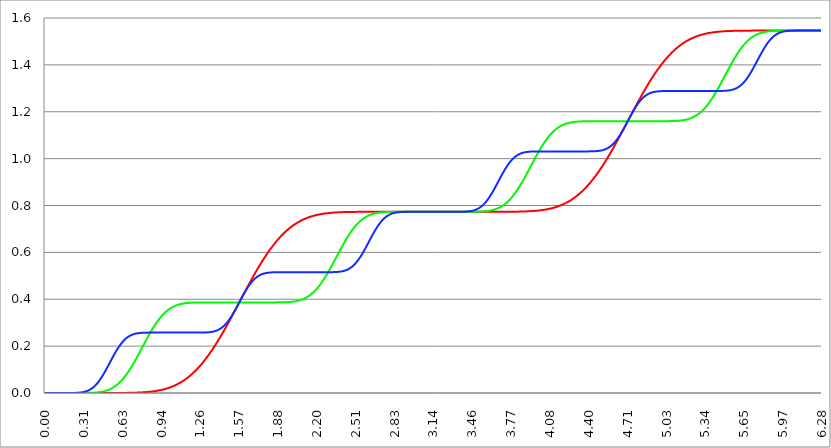
| Category | Series 1 | Series 0 | Series 2 |
|---|---|---|---|
| 0.0 | 0 | 0 | 0 |
| 0.00314159265358979 | 0 | 0 | 0 |
| 0.00628318530717958 | 0 | 0 | 0 |
| 0.00942477796076938 | 0 | 0 | 0 |
| 0.0125663706143592 | 0 | 0 | 0 |
| 0.015707963267949 | 0 | 0 | 0 |
| 0.0188495559215388 | 0 | 0 | 0 |
| 0.0219911485751285 | 0 | 0 | 0 |
| 0.0251327412287183 | 0 | 0 | 0 |
| 0.0282743338823081 | 0 | 0 | 0 |
| 0.0314159265358979 | 0 | 0 | 0 |
| 0.0345575191894877 | 0 | 0 | 0 |
| 0.0376991118430775 | 0 | 0 | 0 |
| 0.0408407044966673 | 0 | 0 | 0 |
| 0.0439822971502571 | 0 | 0 | 0 |
| 0.0471238898038469 | 0 | 0 | 0 |
| 0.0502654824574367 | 0 | 0 | 0 |
| 0.0534070751110265 | 0 | 0 | 0 |
| 0.0565486677646163 | 0 | 0 | 0 |
| 0.059690260418206 | 0 | 0 | 0 |
| 0.0628318530717958 | 0 | 0 | 0 |
| 0.0659734457253856 | 0 | 0 | 0 |
| 0.0691150383789754 | 0 | 0 | 0 |
| 0.0722566310325652 | 0 | 0 | 0 |
| 0.075398223686155 | 0 | 0 | 0 |
| 0.0785398163397448 | 0 | 0 | 0 |
| 0.0816814089933346 | 0 | 0 | 0 |
| 0.0848230016469244 | 0 | 0 | 0 |
| 0.0879645943005142 | 0 | 0 | 0 |
| 0.091106186954104 | 0 | 0 | 0 |
| 0.0942477796076937 | 0 | 0 | 0 |
| 0.0973893722612835 | 0 | 0 | 0 |
| 0.100530964914873 | 0 | 0 | 0 |
| 0.103672557568463 | 0 | 0 | 0 |
| 0.106814150222053 | 0 | 0 | 0 |
| 0.109955742875643 | 0 | 0 | 0 |
| 0.113097335529233 | 0 | 0 | 0 |
| 0.116238928182822 | 0 | 0 | 0 |
| 0.119380520836412 | 0 | 0 | 0 |
| 0.122522113490002 | 0 | 0 | 0 |
| 0.125663706143592 | 0 | 0 | 0 |
| 0.128805298797181 | 0 | 0 | 0 |
| 0.131946891450771 | 0 | 0 | 0 |
| 0.135088484104361 | 0 | 0 | 0 |
| 0.138230076757951 | 0 | 0 | 0 |
| 0.141371669411541 | 0 | 0 | 0 |
| 0.14451326206513 | 0 | 0 | 0 |
| 0.14765485471872 | 0 | 0 | 0 |
| 0.15079644737231 | 0 | 0 | 0 |
| 0.1539380400259 | 0 | 0 | 0 |
| 0.15707963267949 | 0 | 0 | 0 |
| 0.160221225333079 | 0 | 0 | 0 |
| 0.163362817986669 | 0 | 0 | 0 |
| 0.166504410640259 | 0 | 0 | 0 |
| 0.169646003293849 | 0 | 0 | 0 |
| 0.172787595947439 | 0 | 0 | 0 |
| 0.175929188601028 | 0 | 0 | 0 |
| 0.179070781254618 | 0 | 0 | 0 |
| 0.182212373908208 | 0 | 0 | 0 |
| 0.185353966561798 | 0 | 0 | 0 |
| 0.188495559215388 | 0 | 0 | 0 |
| 0.191637151868977 | 0 | 0 | 0 |
| 0.194778744522567 | 0 | 0 | 0 |
| 0.197920337176157 | 0 | 0 | 0 |
| 0.201061929829747 | 0 | 0 | 0 |
| 0.204203522483336 | 0 | 0 | 0 |
| 0.207345115136926 | 0 | 0 | 0 |
| 0.210486707790516 | 0 | 0 | 0 |
| 0.213628300444106 | 0 | 0 | 0 |
| 0.216769893097696 | 0 | 0 | 0 |
| 0.219911485751285 | 0 | 0 | 0 |
| 0.223053078404875 | 0 | 0 | 0 |
| 0.226194671058465 | 0 | 0 | 0 |
| 0.229336263712055 | 0 | 0 | 0 |
| 0.232477856365645 | 0 | 0 | 0 |
| 0.235619449019234 | 0 | 0 | 0 |
| 0.238761041672824 | 0 | 0 | 0 |
| 0.241902634326414 | 0 | 0 | 0 |
| 0.245044226980004 | 0 | 0 | 0 |
| 0.248185819633594 | 0 | 0 | 0.001 |
| 0.251327412287183 | 0 | 0 | 0.001 |
| 0.254469004940773 | 0 | 0 | 0.001 |
| 0.257610597594363 | 0 | 0 | 0.001 |
| 0.260752190247953 | 0 | 0 | 0.001 |
| 0.263893782901543 | 0 | 0 | 0.001 |
| 0.267035375555132 | 0 | 0 | 0.001 |
| 0.270176968208722 | 0 | 0 | 0.001 |
| 0.273318560862312 | 0 | 0 | 0.001 |
| 0.276460153515902 | 0 | 0 | 0.001 |
| 0.279601746169492 | 0 | 0 | 0.002 |
| 0.282743338823082 | 0 | 0 | 0.002 |
| 0.285884931476671 | 0 | 0 | 0.002 |
| 0.289026524130261 | 0 | 0 | 0.002 |
| 0.292168116783851 | 0 | 0 | 0.002 |
| 0.295309709437441 | 0 | 0 | 0.003 |
| 0.298451302091031 | 0 | 0 | 0.003 |
| 0.30159289474462 | 0 | 0 | 0.003 |
| 0.30473448739821 | 0 | 0 | 0.003 |
| 0.3078760800518 | 0 | 0 | 0.004 |
| 0.31101767270539 | 0 | 0 | 0.004 |
| 0.31415926535898 | 0 | 0 | 0.004 |
| 0.31730085801257 | 0 | 0 | 0.005 |
| 0.320442450666159 | 0 | 0 | 0.005 |
| 0.323584043319749 | 0 | 0 | 0.006 |
| 0.326725635973339 | 0 | 0 | 0.006 |
| 0.329867228626929 | 0 | 0 | 0.007 |
| 0.333008821280519 | 0 | 0 | 0.007 |
| 0.336150413934108 | 0 | 0 | 0.008 |
| 0.339292006587698 | 0 | 0 | 0.008 |
| 0.342433599241288 | 0 | 0 | 0.009 |
| 0.345575191894878 | 0 | 0 | 0.01 |
| 0.348716784548468 | 0 | 0 | 0.01 |
| 0.351858377202058 | 0 | 0 | 0.011 |
| 0.354999969855647 | 0 | 0.001 | 0.012 |
| 0.358141562509237 | 0 | 0.001 | 0.013 |
| 0.361283155162827 | 0 | 0.001 | 0.014 |
| 0.364424747816417 | 0 | 0.001 | 0.015 |
| 0.367566340470007 | 0 | 0.001 | 0.016 |
| 0.370707933123597 | 0 | 0.001 | 0.017 |
| 0.373849525777186 | 0 | 0.001 | 0.018 |
| 0.376991118430776 | 0 | 0.001 | 0.019 |
| 0.380132711084366 | 0 | 0.001 | 0.02 |
| 0.383274303737956 | 0 | 0.001 | 0.021 |
| 0.386415896391546 | 0 | 0.001 | 0.023 |
| 0.389557489045135 | 0 | 0.001 | 0.024 |
| 0.392699081698725 | 0 | 0.001 | 0.025 |
| 0.395840674352315 | 0 | 0.001 | 0.027 |
| 0.398982267005905 | 0 | 0.002 | 0.028 |
| 0.402123859659495 | 0 | 0.002 | 0.03 |
| 0.405265452313085 | 0 | 0.002 | 0.032 |
| 0.408407044966674 | 0 | 0.002 | 0.033 |
| 0.411548637620264 | 0 | 0.002 | 0.035 |
| 0.414690230273854 | 0 | 0.002 | 0.037 |
| 0.417831822927444 | 0 | 0.002 | 0.039 |
| 0.420973415581034 | 0 | 0.003 | 0.04 |
| 0.424115008234623 | 0 | 0.003 | 0.042 |
| 0.427256600888213 | 0 | 0.003 | 0.044 |
| 0.430398193541803 | 0 | 0.003 | 0.047 |
| 0.433539786195393 | 0 | 0.003 | 0.049 |
| 0.436681378848983 | 0 | 0.003 | 0.051 |
| 0.439822971502573 | 0 | 0.004 | 0.053 |
| 0.442964564156162 | 0 | 0.004 | 0.055 |
| 0.446106156809752 | 0 | 0.004 | 0.058 |
| 0.449247749463342 | 0 | 0.004 | 0.06 |
| 0.452389342116932 | 0 | 0.005 | 0.063 |
| 0.455530934770522 | 0 | 0.005 | 0.065 |
| 0.458672527424111 | 0 | 0.005 | 0.068 |
| 0.461814120077701 | 0 | 0.006 | 0.07 |
| 0.464955712731291 | 0 | 0.006 | 0.073 |
| 0.468097305384881 | 0 | 0.006 | 0.076 |
| 0.471238898038471 | 0 | 0.007 | 0.079 |
| 0.474380490692061 | 0 | 0.007 | 0.081 |
| 0.47752208334565 | 0 | 0.007 | 0.084 |
| 0.48066367599924 | 0 | 0.008 | 0.087 |
| 0.48380526865283 | 0 | 0.008 | 0.09 |
| 0.48694686130642 | 0 | 0.009 | 0.093 |
| 0.49008845396001 | 0 | 0.009 | 0.096 |
| 0.493230046613599 | 0 | 0.01 | 0.099 |
| 0.496371639267189 | 0 | 0.01 | 0.102 |
| 0.499513231920779 | 0 | 0.011 | 0.105 |
| 0.502654824574369 | 0 | 0.011 | 0.108 |
| 0.505796417227959 | 0 | 0.012 | 0.111 |
| 0.508938009881549 | 0 | 0.013 | 0.114 |
| 0.512079602535138 | 0 | 0.013 | 0.117 |
| 0.515221195188728 | 0 | 0.014 | 0.12 |
| 0.518362787842318 | 0 | 0.015 | 0.124 |
| 0.521504380495908 | 0 | 0.015 | 0.127 |
| 0.524645973149498 | 0 | 0.016 | 0.13 |
| 0.527787565803087 | 0 | 0.017 | 0.133 |
| 0.530929158456677 | 0 | 0.018 | 0.136 |
| 0.534070751110267 | 0 | 0.018 | 0.139 |
| 0.537212343763857 | 0 | 0.019 | 0.142 |
| 0.540353936417447 | 0 | 0.02 | 0.146 |
| 0.543495529071037 | 0 | 0.021 | 0.149 |
| 0.546637121724626 | 0 | 0.022 | 0.152 |
| 0.549778714378216 | 0 | 0.023 | 0.155 |
| 0.552920307031806 | 0 | 0.024 | 0.158 |
| 0.556061899685396 | 0 | 0.025 | 0.161 |
| 0.559203492338986 | 0 | 0.026 | 0.164 |
| 0.562345084992576 | 0 | 0.027 | 0.167 |
| 0.565486677646165 | 0 | 0.028 | 0.17 |
| 0.568628270299755 | 0 | 0.03 | 0.173 |
| 0.571769862953345 | 0 | 0.031 | 0.175 |
| 0.574911455606935 | 0 | 0.032 | 0.178 |
| 0.578053048260525 | 0 | 0.033 | 0.181 |
| 0.581194640914114 | 0 | 0.035 | 0.184 |
| 0.584336233567704 | 0 | 0.036 | 0.186 |
| 0.587477826221294 | 0 | 0.037 | 0.189 |
| 0.590619418874884 | 0 | 0.039 | 0.192 |
| 0.593761011528474 | 0 | 0.04 | 0.194 |
| 0.596902604182064 | 0 | 0.042 | 0.197 |
| 0.600044196835653 | 0 | 0.043 | 0.199 |
| 0.603185789489243 | 0 | 0.045 | 0.201 |
| 0.606327382142833 | 0 | 0.046 | 0.204 |
| 0.609468974796423 | 0 | 0.048 | 0.206 |
| 0.612610567450013 | 0 | 0.05 | 0.208 |
| 0.615752160103602 | 0 | 0.052 | 0.21 |
| 0.618893752757192 | 0 | 0.053 | 0.213 |
| 0.622035345410782 | 0 | 0.055 | 0.215 |
| 0.625176938064372 | 0 | 0.057 | 0.217 |
| 0.628318530717962 | 0 | 0.059 | 0.219 |
| 0.631460123371551 | 0 | 0.061 | 0.22 |
| 0.634601716025141 | 0 | 0.063 | 0.222 |
| 0.637743308678731 | 0 | 0.065 | 0.224 |
| 0.640884901332321 | 0 | 0.067 | 0.226 |
| 0.644026493985911 | 0 | 0.069 | 0.227 |
| 0.647168086639501 | 0 | 0.071 | 0.229 |
| 0.65030967929309 | 0 | 0.073 | 0.23 |
| 0.65345127194668 | 0 | 0.075 | 0.232 |
| 0.65659286460027 | 0 | 0.077 | 0.233 |
| 0.65973445725386 | 0.001 | 0.08 | 0.235 |
| 0.66287604990745 | 0.001 | 0.082 | 0.236 |
| 0.666017642561039 | 0.001 | 0.084 | 0.237 |
| 0.669159235214629 | 0.001 | 0.087 | 0.238 |
| 0.672300827868219 | 0.001 | 0.089 | 0.24 |
| 0.675442420521809 | 0.001 | 0.092 | 0.241 |
| 0.678584013175399 | 0.001 | 0.094 | 0.242 |
| 0.681725605828989 | 0.001 | 0.097 | 0.243 |
| 0.684867198482578 | 0.001 | 0.099 | 0.244 |
| 0.688008791136168 | 0.001 | 0.102 | 0.245 |
| 0.691150383789758 | 0.001 | 0.104 | 0.245 |
| 0.694291976443348 | 0.001 | 0.107 | 0.246 |
| 0.697433569096938 | 0.001 | 0.11 | 0.247 |
| 0.700575161750528 | 0.001 | 0.112 | 0.248 |
| 0.703716754404117 | 0.001 | 0.115 | 0.248 |
| 0.706858347057707 | 0.001 | 0.118 | 0.249 |
| 0.709999939711297 | 0.001 | 0.121 | 0.25 |
| 0.713141532364887 | 0.001 | 0.123 | 0.25 |
| 0.716283125018477 | 0.001 | 0.126 | 0.251 |
| 0.719424717672066 | 0.001 | 0.129 | 0.251 |
| 0.722566310325656 | 0.001 | 0.132 | 0.252 |
| 0.725707902979246 | 0.001 | 0.135 | 0.252 |
| 0.728849495632836 | 0.001 | 0.138 | 0.253 |
| 0.731991088286426 | 0.001 | 0.141 | 0.253 |
| 0.735132680940016 | 0.001 | 0.144 | 0.253 |
| 0.738274273593605 | 0.001 | 0.147 | 0.254 |
| 0.741415866247195 | 0.002 | 0.15 | 0.254 |
| 0.744557458900785 | 0.002 | 0.153 | 0.254 |
| 0.747699051554375 | 0.002 | 0.156 | 0.255 |
| 0.750840644207965 | 0.002 | 0.159 | 0.255 |
| 0.753982236861554 | 0.002 | 0.162 | 0.255 |
| 0.757123829515144 | 0.002 | 0.165 | 0.255 |
| 0.760265422168734 | 0.002 | 0.168 | 0.256 |
| 0.763407014822324 | 0.002 | 0.171 | 0.256 |
| 0.766548607475914 | 0.002 | 0.174 | 0.256 |
| 0.769690200129504 | 0.002 | 0.178 | 0.256 |
| 0.772831792783093 | 0.002 | 0.181 | 0.256 |
| 0.775973385436683 | 0.002 | 0.184 | 0.256 |
| 0.779114978090273 | 0.002 | 0.187 | 0.257 |
| 0.782256570743863 | 0.003 | 0.19 | 0.257 |
| 0.785398163397453 | 0.003 | 0.193 | 0.257 |
| 0.788539756051042 | 0.003 | 0.196 | 0.257 |
| 0.791681348704632 | 0.003 | 0.2 | 0.257 |
| 0.794822941358222 | 0.003 | 0.203 | 0.257 |
| 0.797964534011812 | 0.003 | 0.206 | 0.257 |
| 0.801106126665402 | 0.003 | 0.209 | 0.257 |
| 0.804247719318992 | 0.003 | 0.212 | 0.257 |
| 0.807389311972581 | 0.003 | 0.215 | 0.257 |
| 0.810530904626171 | 0.004 | 0.218 | 0.257 |
| 0.813672497279761 | 0.004 | 0.221 | 0.257 |
| 0.816814089933351 | 0.004 | 0.224 | 0.257 |
| 0.819955682586941 | 0.004 | 0.228 | 0.257 |
| 0.823097275240531 | 0.004 | 0.231 | 0.258 |
| 0.82623886789412 | 0.004 | 0.234 | 0.258 |
| 0.82938046054771 | 0.004 | 0.237 | 0.258 |
| 0.8325220532013 | 0.005 | 0.24 | 0.258 |
| 0.83566364585489 | 0.005 | 0.243 | 0.258 |
| 0.83880523850848 | 0.005 | 0.246 | 0.258 |
| 0.841946831162069 | 0.005 | 0.249 | 0.258 |
| 0.845088423815659 | 0.005 | 0.252 | 0.258 |
| 0.848230016469249 | 0.005 | 0.254 | 0.258 |
| 0.851371609122839 | 0.006 | 0.257 | 0.258 |
| 0.854513201776429 | 0.006 | 0.26 | 0.258 |
| 0.857654794430019 | 0.006 | 0.263 | 0.258 |
| 0.860796387083608 | 0.006 | 0.266 | 0.258 |
| 0.863937979737198 | 0.006 | 0.269 | 0.258 |
| 0.867079572390788 | 0.007 | 0.271 | 0.258 |
| 0.870221165044378 | 0.007 | 0.274 | 0.258 |
| 0.873362757697968 | 0.007 | 0.277 | 0.258 |
| 0.876504350351557 | 0.007 | 0.28 | 0.258 |
| 0.879645943005147 | 0.007 | 0.282 | 0.258 |
| 0.882787535658737 | 0.008 | 0.285 | 0.258 |
| 0.885929128312327 | 0.008 | 0.287 | 0.258 |
| 0.889070720965917 | 0.008 | 0.29 | 0.258 |
| 0.892212313619507 | 0.008 | 0.292 | 0.258 |
| 0.895353906273096 | 0.009 | 0.295 | 0.258 |
| 0.898495498926686 | 0.009 | 0.297 | 0.258 |
| 0.901637091580276 | 0.009 | 0.3 | 0.258 |
| 0.904778684233866 | 0.009 | 0.302 | 0.258 |
| 0.907920276887456 | 0.01 | 0.305 | 0.258 |
| 0.911061869541045 | 0.01 | 0.307 | 0.258 |
| 0.914203462194635 | 0.01 | 0.309 | 0.258 |
| 0.917345054848225 | 0.011 | 0.311 | 0.258 |
| 0.920486647501815 | 0.011 | 0.313 | 0.258 |
| 0.923628240155405 | 0.011 | 0.316 | 0.258 |
| 0.926769832808995 | 0.012 | 0.318 | 0.258 |
| 0.929911425462584 | 0.012 | 0.32 | 0.258 |
| 0.933053018116174 | 0.012 | 0.322 | 0.258 |
| 0.936194610769764 | 0.013 | 0.324 | 0.258 |
| 0.939336203423354 | 0.013 | 0.326 | 0.258 |
| 0.942477796076944 | 0.013 | 0.328 | 0.258 |
| 0.945619388730533 | 0.014 | 0.33 | 0.258 |
| 0.948760981384123 | 0.014 | 0.331 | 0.258 |
| 0.951902574037713 | 0.015 | 0.333 | 0.258 |
| 0.955044166691303 | 0.015 | 0.335 | 0.258 |
| 0.958185759344893 | 0.015 | 0.337 | 0.258 |
| 0.961327351998483 | 0.016 | 0.338 | 0.258 |
| 0.964468944652072 | 0.016 | 0.34 | 0.258 |
| 0.967610537305662 | 0.017 | 0.342 | 0.258 |
| 0.970752129959252 | 0.017 | 0.343 | 0.258 |
| 0.973893722612842 | 0.018 | 0.345 | 0.258 |
| 0.977035315266432 | 0.018 | 0.346 | 0.258 |
| 0.980176907920022 | 0.019 | 0.348 | 0.258 |
| 0.983318500573611 | 0.019 | 0.349 | 0.258 |
| 0.986460093227201 | 0.02 | 0.351 | 0.258 |
| 0.989601685880791 | 0.02 | 0.352 | 0.258 |
| 0.992743278534381 | 0.021 | 0.353 | 0.258 |
| 0.995884871187971 | 0.021 | 0.355 | 0.258 |
| 0.99902646384156 | 0.022 | 0.356 | 0.258 |
| 1.00216805649515 | 0.022 | 0.357 | 0.258 |
| 1.00530964914874 | 0.023 | 0.358 | 0.258 |
| 1.00845124180233 | 0.023 | 0.359 | 0.258 |
| 1.01159283445592 | 0.024 | 0.36 | 0.258 |
| 1.01473442710951 | 0.025 | 0.361 | 0.258 |
| 1.017876019763099 | 0.025 | 0.363 | 0.258 |
| 1.021017612416689 | 0.026 | 0.364 | 0.258 |
| 1.02415920507028 | 0.027 | 0.365 | 0.258 |
| 1.027300797723869 | 0.027 | 0.365 | 0.258 |
| 1.030442390377459 | 0.028 | 0.366 | 0.258 |
| 1.033583983031048 | 0.029 | 0.367 | 0.258 |
| 1.036725575684638 | 0.029 | 0.368 | 0.258 |
| 1.039867168338228 | 0.03 | 0.369 | 0.258 |
| 1.043008760991818 | 0.031 | 0.37 | 0.258 |
| 1.046150353645408 | 0.031 | 0.37 | 0.258 |
| 1.049291946298998 | 0.032 | 0.371 | 0.258 |
| 1.052433538952587 | 0.033 | 0.372 | 0.258 |
| 1.055575131606177 | 0.034 | 0.373 | 0.258 |
| 1.058716724259767 | 0.034 | 0.373 | 0.258 |
| 1.061858316913357 | 0.035 | 0.374 | 0.258 |
| 1.064999909566947 | 0.036 | 0.375 | 0.258 |
| 1.068141502220536 | 0.037 | 0.375 | 0.258 |
| 1.071283094874126 | 0.038 | 0.376 | 0.258 |
| 1.074424687527716 | 0.039 | 0.376 | 0.258 |
| 1.077566280181306 | 0.04 | 0.377 | 0.258 |
| 1.080707872834896 | 0.04 | 0.377 | 0.258 |
| 1.083849465488486 | 0.041 | 0.378 | 0.258 |
| 1.086991058142075 | 0.042 | 0.378 | 0.258 |
| 1.090132650795665 | 0.043 | 0.379 | 0.258 |
| 1.093274243449255 | 0.044 | 0.379 | 0.258 |
| 1.096415836102845 | 0.045 | 0.379 | 0.258 |
| 1.099557428756435 | 0.046 | 0.38 | 0.258 |
| 1.102699021410025 | 0.047 | 0.38 | 0.258 |
| 1.105840614063614 | 0.048 | 0.381 | 0.258 |
| 1.108982206717204 | 0.049 | 0.381 | 0.258 |
| 1.112123799370794 | 0.05 | 0.381 | 0.258 |
| 1.115265392024384 | 0.051 | 0.382 | 0.258 |
| 1.118406984677974 | 0.052 | 0.382 | 0.258 |
| 1.121548577331563 | 0.053 | 0.382 | 0.258 |
| 1.124690169985153 | 0.055 | 0.382 | 0.258 |
| 1.127831762638743 | 0.056 | 0.383 | 0.258 |
| 1.130973355292333 | 0.057 | 0.383 | 0.258 |
| 1.134114947945923 | 0.058 | 0.383 | 0.258 |
| 1.137256540599513 | 0.059 | 0.383 | 0.258 |
| 1.140398133253102 | 0.06 | 0.384 | 0.258 |
| 1.143539725906692 | 0.062 | 0.384 | 0.258 |
| 1.146681318560282 | 0.063 | 0.384 | 0.258 |
| 1.149822911213872 | 0.064 | 0.384 | 0.258 |
| 1.152964503867462 | 0.065 | 0.384 | 0.258 |
| 1.156106096521051 | 0.067 | 0.384 | 0.258 |
| 1.159247689174641 | 0.068 | 0.385 | 0.258 |
| 1.162389281828231 | 0.069 | 0.385 | 0.258 |
| 1.165530874481821 | 0.071 | 0.385 | 0.258 |
| 1.168672467135411 | 0.072 | 0.385 | 0.258 |
| 1.171814059789001 | 0.073 | 0.385 | 0.258 |
| 1.17495565244259 | 0.075 | 0.385 | 0.258 |
| 1.17809724509618 | 0.076 | 0.385 | 0.258 |
| 1.18123883774977 | 0.078 | 0.385 | 0.258 |
| 1.18438043040336 | 0.079 | 0.385 | 0.258 |
| 1.18752202305695 | 0.08 | 0.386 | 0.258 |
| 1.190663615710539 | 0.082 | 0.386 | 0.258 |
| 1.193805208364129 | 0.083 | 0.386 | 0.258 |
| 1.19694680101772 | 0.085 | 0.386 | 0.258 |
| 1.200088393671309 | 0.087 | 0.386 | 0.258 |
| 1.203229986324899 | 0.088 | 0.386 | 0.258 |
| 1.206371578978489 | 0.09 | 0.386 | 0.258 |
| 1.209513171632078 | 0.091 | 0.386 | 0.258 |
| 1.212654764285668 | 0.093 | 0.386 | 0.258 |
| 1.215796356939258 | 0.095 | 0.386 | 0.258 |
| 1.218937949592848 | 0.096 | 0.386 | 0.258 |
| 1.222079542246438 | 0.098 | 0.386 | 0.258 |
| 1.225221134900027 | 0.1 | 0.386 | 0.258 |
| 1.228362727553617 | 0.101 | 0.386 | 0.258 |
| 1.231504320207207 | 0.103 | 0.386 | 0.258 |
| 1.234645912860797 | 0.105 | 0.386 | 0.258 |
| 1.237787505514387 | 0.107 | 0.386 | 0.258 |
| 1.240929098167977 | 0.108 | 0.386 | 0.258 |
| 1.244070690821566 | 0.11 | 0.386 | 0.258 |
| 1.247212283475156 | 0.112 | 0.386 | 0.258 |
| 1.250353876128746 | 0.114 | 0.386 | 0.258 |
| 1.253495468782336 | 0.116 | 0.386 | 0.258 |
| 1.256637061435926 | 0.118 | 0.386 | 0.258 |
| 1.259778654089515 | 0.12 | 0.386 | 0.258 |
| 1.262920246743105 | 0.121 | 0.386 | 0.258 |
| 1.266061839396695 | 0.123 | 0.386 | 0.258 |
| 1.269203432050285 | 0.125 | 0.386 | 0.258 |
| 1.272345024703875 | 0.127 | 0.386 | 0.258 |
| 1.275486617357465 | 0.129 | 0.386 | 0.258 |
| 1.278628210011054 | 0.131 | 0.386 | 0.258 |
| 1.281769802664644 | 0.133 | 0.386 | 0.258 |
| 1.284911395318234 | 0.136 | 0.387 | 0.258 |
| 1.288052987971824 | 0.138 | 0.387 | 0.258 |
| 1.291194580625414 | 0.14 | 0.387 | 0.258 |
| 1.294336173279003 | 0.142 | 0.387 | 0.258 |
| 1.297477765932593 | 0.144 | 0.387 | 0.258 |
| 1.300619358586183 | 0.146 | 0.387 | 0.258 |
| 1.303760951239773 | 0.148 | 0.387 | 0.258 |
| 1.306902543893363 | 0.151 | 0.387 | 0.259 |
| 1.310044136546953 | 0.153 | 0.387 | 0.259 |
| 1.313185729200542 | 0.155 | 0.387 | 0.259 |
| 1.316327321854132 | 0.157 | 0.387 | 0.259 |
| 1.319468914507722 | 0.16 | 0.387 | 0.259 |
| 1.322610507161312 | 0.162 | 0.387 | 0.259 |
| 1.325752099814902 | 0.164 | 0.387 | 0.259 |
| 1.328893692468491 | 0.166 | 0.387 | 0.259 |
| 1.332035285122081 | 0.169 | 0.387 | 0.26 |
| 1.335176877775671 | 0.171 | 0.387 | 0.26 |
| 1.338318470429261 | 0.174 | 0.387 | 0.26 |
| 1.341460063082851 | 0.176 | 0.387 | 0.26 |
| 1.344601655736441 | 0.178 | 0.387 | 0.26 |
| 1.34774324839003 | 0.181 | 0.387 | 0.261 |
| 1.35088484104362 | 0.183 | 0.387 | 0.261 |
| 1.35402643369721 | 0.186 | 0.387 | 0.261 |
| 1.3571680263508 | 0.188 | 0.387 | 0.262 |
| 1.36030961900439 | 0.191 | 0.387 | 0.262 |
| 1.363451211657979 | 0.193 | 0.387 | 0.262 |
| 1.36659280431157 | 0.196 | 0.387 | 0.263 |
| 1.369734396965159 | 0.198 | 0.387 | 0.263 |
| 1.372875989618749 | 0.201 | 0.387 | 0.264 |
| 1.376017582272339 | 0.203 | 0.387 | 0.264 |
| 1.379159174925929 | 0.206 | 0.387 | 0.265 |
| 1.382300767579518 | 0.209 | 0.387 | 0.265 |
| 1.385442360233108 | 0.211 | 0.387 | 0.266 |
| 1.388583952886698 | 0.214 | 0.387 | 0.267 |
| 1.391725545540288 | 0.217 | 0.387 | 0.267 |
| 1.394867138193878 | 0.219 | 0.387 | 0.268 |
| 1.398008730847468 | 0.222 | 0.387 | 0.269 |
| 1.401150323501057 | 0.225 | 0.387 | 0.269 |
| 1.404291916154647 | 0.227 | 0.387 | 0.27 |
| 1.407433508808237 | 0.23 | 0.387 | 0.271 |
| 1.410575101461827 | 0.233 | 0.387 | 0.272 |
| 1.413716694115417 | 0.236 | 0.387 | 0.273 |
| 1.416858286769006 | 0.239 | 0.387 | 0.274 |
| 1.419999879422596 | 0.241 | 0.387 | 0.275 |
| 1.423141472076186 | 0.244 | 0.387 | 0.276 |
| 1.426283064729776 | 0.247 | 0.387 | 0.277 |
| 1.429424657383366 | 0.25 | 0.387 | 0.279 |
| 1.432566250036956 | 0.253 | 0.387 | 0.28 |
| 1.435707842690545 | 0.255 | 0.387 | 0.281 |
| 1.438849435344135 | 0.258 | 0.387 | 0.283 |
| 1.441991027997725 | 0.261 | 0.387 | 0.284 |
| 1.445132620651315 | 0.264 | 0.387 | 0.286 |
| 1.448274213304905 | 0.267 | 0.387 | 0.287 |
| 1.451415805958494 | 0.27 | 0.387 | 0.289 |
| 1.454557398612084 | 0.273 | 0.387 | 0.29 |
| 1.457698991265674 | 0.276 | 0.387 | 0.292 |
| 1.460840583919264 | 0.279 | 0.387 | 0.294 |
| 1.463982176572854 | 0.282 | 0.387 | 0.296 |
| 1.467123769226444 | 0.285 | 0.387 | 0.298 |
| 1.470265361880033 | 0.288 | 0.387 | 0.3 |
| 1.473406954533623 | 0.291 | 0.387 | 0.302 |
| 1.476548547187213 | 0.294 | 0.387 | 0.304 |
| 1.479690139840803 | 0.297 | 0.387 | 0.306 |
| 1.482831732494393 | 0.3 | 0.387 | 0.308 |
| 1.485973325147982 | 0.303 | 0.387 | 0.31 |
| 1.489114917801572 | 0.306 | 0.387 | 0.312 |
| 1.492256510455162 | 0.309 | 0.387 | 0.315 |
| 1.495398103108752 | 0.312 | 0.387 | 0.317 |
| 1.498539695762342 | 0.315 | 0.387 | 0.32 |
| 1.501681288415932 | 0.318 | 0.387 | 0.322 |
| 1.504822881069521 | 0.321 | 0.387 | 0.325 |
| 1.507964473723111 | 0.324 | 0.387 | 0.327 |
| 1.511106066376701 | 0.327 | 0.387 | 0.33 |
| 1.514247659030291 | 0.33 | 0.387 | 0.333 |
| 1.517389251683881 | 0.333 | 0.387 | 0.335 |
| 1.520530844337471 | 0.337 | 0.387 | 0.338 |
| 1.52367243699106 | 0.34 | 0.387 | 0.341 |
| 1.52681402964465 | 0.343 | 0.387 | 0.344 |
| 1.52995562229824 | 0.346 | 0.387 | 0.347 |
| 1.53309721495183 | 0.349 | 0.387 | 0.35 |
| 1.53623880760542 | 0.352 | 0.387 | 0.353 |
| 1.539380400259009 | 0.355 | 0.387 | 0.356 |
| 1.542521992912599 | 0.358 | 0.387 | 0.359 |
| 1.545663585566189 | 0.361 | 0.387 | 0.362 |
| 1.548805178219779 | 0.365 | 0.387 | 0.365 |
| 1.551946770873369 | 0.368 | 0.387 | 0.368 |
| 1.555088363526959 | 0.371 | 0.387 | 0.371 |
| 1.558229956180548 | 0.374 | 0.387 | 0.374 |
| 1.561371548834138 | 0.377 | 0.387 | 0.377 |
| 1.564513141487728 | 0.38 | 0.387 | 0.38 |
| 1.567654734141318 | 0.383 | 0.387 | 0.383 |
| 1.570796326794908 | 0.387 | 0.387 | 0.387 |
| 1.573937919448497 | 0.39 | 0.387 | 0.39 |
| 1.577079512102087 | 0.393 | 0.387 | 0.393 |
| 1.580221104755677 | 0.396 | 0.387 | 0.396 |
| 1.583362697409267 | 0.399 | 0.387 | 0.399 |
| 1.586504290062857 | 0.402 | 0.387 | 0.402 |
| 1.589645882716447 | 0.405 | 0.387 | 0.405 |
| 1.592787475370036 | 0.409 | 0.387 | 0.408 |
| 1.595929068023626 | 0.412 | 0.387 | 0.411 |
| 1.599070660677216 | 0.415 | 0.387 | 0.415 |
| 1.602212253330806 | 0.418 | 0.387 | 0.418 |
| 1.605353845984396 | 0.421 | 0.387 | 0.421 |
| 1.608495438637985 | 0.424 | 0.387 | 0.423 |
| 1.611637031291575 | 0.427 | 0.387 | 0.426 |
| 1.614778623945165 | 0.43 | 0.387 | 0.429 |
| 1.617920216598755 | 0.434 | 0.387 | 0.432 |
| 1.621061809252345 | 0.437 | 0.387 | 0.435 |
| 1.624203401905935 | 0.44 | 0.387 | 0.438 |
| 1.627344994559524 | 0.443 | 0.387 | 0.441 |
| 1.630486587213114 | 0.446 | 0.387 | 0.443 |
| 1.633628179866704 | 0.449 | 0.387 | 0.446 |
| 1.636769772520294 | 0.452 | 0.387 | 0.448 |
| 1.639911365173884 | 0.455 | 0.387 | 0.451 |
| 1.643052957827473 | 0.458 | 0.387 | 0.454 |
| 1.646194550481063 | 0.461 | 0.387 | 0.456 |
| 1.649336143134653 | 0.464 | 0.387 | 0.458 |
| 1.652477735788243 | 0.467 | 0.387 | 0.461 |
| 1.655619328441833 | 0.47 | 0.387 | 0.463 |
| 1.658760921095423 | 0.473 | 0.387 | 0.465 |
| 1.661902513749012 | 0.476 | 0.387 | 0.467 |
| 1.665044106402602 | 0.479 | 0.387 | 0.47 |
| 1.668185699056192 | 0.482 | 0.387 | 0.472 |
| 1.671327291709782 | 0.485 | 0.387 | 0.474 |
| 1.674468884363372 | 0.488 | 0.387 | 0.476 |
| 1.677610477016961 | 0.491 | 0.387 | 0.477 |
| 1.680752069670551 | 0.494 | 0.387 | 0.479 |
| 1.683893662324141 | 0.497 | 0.387 | 0.481 |
| 1.687035254977731 | 0.5 | 0.387 | 0.483 |
| 1.690176847631321 | 0.503 | 0.387 | 0.484 |
| 1.693318440284911 | 0.506 | 0.387 | 0.486 |
| 1.6964600329385 | 0.509 | 0.387 | 0.488 |
| 1.69960162559209 | 0.512 | 0.387 | 0.489 |
| 1.70274321824568 | 0.515 | 0.387 | 0.491 |
| 1.70588481089927 | 0.518 | 0.387 | 0.492 |
| 1.70902640355286 | 0.521 | 0.387 | 0.493 |
| 1.712167996206449 | 0.523 | 0.387 | 0.494 |
| 1.715309588860039 | 0.526 | 0.387 | 0.496 |
| 1.71845118151363 | 0.529 | 0.387 | 0.497 |
| 1.721592774167219 | 0.532 | 0.387 | 0.498 |
| 1.724734366820809 | 0.535 | 0.387 | 0.499 |
| 1.727875959474399 | 0.537 | 0.387 | 0.5 |
| 1.731017552127988 | 0.54 | 0.387 | 0.501 |
| 1.734159144781578 | 0.543 | 0.387 | 0.502 |
| 1.737300737435168 | 0.546 | 0.387 | 0.503 |
| 1.740442330088758 | 0.548 | 0.387 | 0.504 |
| 1.743583922742348 | 0.551 | 0.387 | 0.504 |
| 1.746725515395937 | 0.554 | 0.387 | 0.505 |
| 1.749867108049527 | 0.556 | 0.387 | 0.506 |
| 1.753008700703117 | 0.559 | 0.387 | 0.507 |
| 1.756150293356707 | 0.562 | 0.387 | 0.507 |
| 1.759291886010297 | 0.564 | 0.387 | 0.508 |
| 1.762433478663887 | 0.567 | 0.387 | 0.508 |
| 1.765575071317476 | 0.57 | 0.387 | 0.509 |
| 1.768716663971066 | 0.572 | 0.387 | 0.509 |
| 1.771858256624656 | 0.575 | 0.387 | 0.51 |
| 1.774999849278246 | 0.577 | 0.387 | 0.51 |
| 1.778141441931836 | 0.58 | 0.387 | 0.511 |
| 1.781283034585426 | 0.582 | 0.387 | 0.511 |
| 1.784424627239015 | 0.585 | 0.387 | 0.511 |
| 1.787566219892605 | 0.587 | 0.387 | 0.512 |
| 1.790707812546195 | 0.59 | 0.387 | 0.512 |
| 1.793849405199785 | 0.592 | 0.387 | 0.512 |
| 1.796990997853375 | 0.595 | 0.387 | 0.513 |
| 1.800132590506964 | 0.597 | 0.387 | 0.513 |
| 1.803274183160554 | 0.6 | 0.387 | 0.513 |
| 1.806415775814144 | 0.602 | 0.387 | 0.513 |
| 1.809557368467734 | 0.604 | 0.387 | 0.514 |
| 1.812698961121324 | 0.607 | 0.387 | 0.514 |
| 1.815840553774914 | 0.609 | 0.387 | 0.514 |
| 1.818982146428503 | 0.611 | 0.387 | 0.514 |
| 1.822123739082093 | 0.614 | 0.387 | 0.514 |
| 1.825265331735683 | 0.616 | 0.387 | 0.514 |
| 1.828406924389273 | 0.618 | 0.387 | 0.514 |
| 1.831548517042863 | 0.62 | 0.387 | 0.514 |
| 1.834690109696452 | 0.623 | 0.387 | 0.515 |
| 1.837831702350042 | 0.625 | 0.387 | 0.515 |
| 1.840973295003632 | 0.627 | 0.387 | 0.515 |
| 1.844114887657222 | 0.629 | 0.387 | 0.515 |
| 1.847256480310812 | 0.631 | 0.387 | 0.515 |
| 1.850398072964402 | 0.633 | 0.387 | 0.515 |
| 1.853539665617991 | 0.636 | 0.387 | 0.515 |
| 1.856681258271581 | 0.638 | 0.387 | 0.515 |
| 1.859822850925171 | 0.64 | 0.387 | 0.515 |
| 1.862964443578761 | 0.642 | 0.387 | 0.515 |
| 1.866106036232351 | 0.644 | 0.387 | 0.515 |
| 1.86924762888594 | 0.646 | 0.387 | 0.515 |
| 1.87238922153953 | 0.648 | 0.387 | 0.515 |
| 1.87553081419312 | 0.65 | 0.387 | 0.515 |
| 1.87867240684671 | 0.652 | 0.387 | 0.515 |
| 1.8818139995003 | 0.654 | 0.387 | 0.515 |
| 1.88495559215389 | 0.656 | 0.387 | 0.515 |
| 1.888097184807479 | 0.657 | 0.387 | 0.515 |
| 1.891238777461069 | 0.659 | 0.387 | 0.515 |
| 1.89438037011466 | 0.661 | 0.387 | 0.515 |
| 1.897521962768249 | 0.663 | 0.387 | 0.515 |
| 1.900663555421839 | 0.665 | 0.387 | 0.515 |
| 1.903805148075429 | 0.667 | 0.387 | 0.515 |
| 1.906946740729018 | 0.668 | 0.387 | 0.515 |
| 1.910088333382608 | 0.67 | 0.387 | 0.515 |
| 1.913229926036198 | 0.672 | 0.387 | 0.515 |
| 1.916371518689788 | 0.674 | 0.387 | 0.515 |
| 1.919513111343378 | 0.675 | 0.387 | 0.515 |
| 1.922654703996967 | 0.677 | 0.387 | 0.515 |
| 1.925796296650557 | 0.679 | 0.387 | 0.515 |
| 1.928937889304147 | 0.68 | 0.387 | 0.515 |
| 1.932079481957737 | 0.682 | 0.387 | 0.515 |
| 1.935221074611327 | 0.683 | 0.387 | 0.515 |
| 1.938362667264917 | 0.685 | 0.387 | 0.515 |
| 1.941504259918506 | 0.687 | 0.387 | 0.515 |
| 1.944645852572096 | 0.688 | 0.387 | 0.515 |
| 1.947787445225686 | 0.69 | 0.387 | 0.515 |
| 1.950929037879276 | 0.691 | 0.388 | 0.515 |
| 1.954070630532866 | 0.693 | 0.388 | 0.515 |
| 1.957212223186455 | 0.694 | 0.388 | 0.515 |
| 1.960353815840045 | 0.696 | 0.388 | 0.515 |
| 1.963495408493635 | 0.697 | 0.388 | 0.515 |
| 1.966637001147225 | 0.698 | 0.388 | 0.515 |
| 1.969778593800815 | 0.7 | 0.388 | 0.515 |
| 1.972920186454405 | 0.701 | 0.388 | 0.515 |
| 1.976061779107994 | 0.703 | 0.388 | 0.515 |
| 1.979203371761584 | 0.704 | 0.388 | 0.515 |
| 1.982344964415174 | 0.705 | 0.389 | 0.515 |
| 1.985486557068764 | 0.707 | 0.389 | 0.515 |
| 1.988628149722354 | 0.708 | 0.389 | 0.515 |
| 1.991769742375943 | 0.709 | 0.389 | 0.515 |
| 1.994911335029533 | 0.71 | 0.389 | 0.515 |
| 1.998052927683123 | 0.712 | 0.389 | 0.515 |
| 2.001194520336712 | 0.713 | 0.39 | 0.515 |
| 2.004336112990302 | 0.714 | 0.39 | 0.515 |
| 2.007477705643892 | 0.715 | 0.39 | 0.515 |
| 2.010619298297482 | 0.716 | 0.39 | 0.515 |
| 2.013760890951071 | 0.717 | 0.39 | 0.515 |
| 2.016902483604661 | 0.719 | 0.391 | 0.515 |
| 2.02004407625825 | 0.72 | 0.391 | 0.515 |
| 2.02318566891184 | 0.721 | 0.391 | 0.515 |
| 2.02632726156543 | 0.722 | 0.392 | 0.515 |
| 2.029468854219019 | 0.723 | 0.392 | 0.515 |
| 2.032610446872609 | 0.724 | 0.392 | 0.515 |
| 2.035752039526198 | 0.725 | 0.393 | 0.515 |
| 2.038893632179788 | 0.726 | 0.393 | 0.515 |
| 2.042035224833378 | 0.727 | 0.393 | 0.515 |
| 2.045176817486967 | 0.728 | 0.394 | 0.515 |
| 2.048318410140557 | 0.729 | 0.394 | 0.515 |
| 2.051460002794146 | 0.73 | 0.394 | 0.515 |
| 2.054601595447736 | 0.731 | 0.395 | 0.515 |
| 2.057743188101325 | 0.732 | 0.395 | 0.515 |
| 2.060884780754915 | 0.733 | 0.396 | 0.515 |
| 2.064026373408505 | 0.734 | 0.396 | 0.515 |
| 2.067167966062094 | 0.734 | 0.397 | 0.515 |
| 2.070309558715684 | 0.735 | 0.397 | 0.515 |
| 2.073451151369273 | 0.736 | 0.398 | 0.515 |
| 2.076592744022863 | 0.737 | 0.399 | 0.515 |
| 2.079734336676452 | 0.738 | 0.399 | 0.515 |
| 2.082875929330042 | 0.739 | 0.4 | 0.515 |
| 2.086017521983632 | 0.739 | 0.4 | 0.515 |
| 2.089159114637221 | 0.74 | 0.401 | 0.515 |
| 2.092300707290811 | 0.741 | 0.402 | 0.515 |
| 2.095442299944401 | 0.742 | 0.403 | 0.515 |
| 2.09858389259799 | 0.742 | 0.403 | 0.515 |
| 2.10172548525158 | 0.743 | 0.404 | 0.515 |
| 2.104867077905169 | 0.744 | 0.405 | 0.515 |
| 2.108008670558759 | 0.745 | 0.406 | 0.515 |
| 2.111150263212349 | 0.745 | 0.407 | 0.515 |
| 2.114291855865938 | 0.746 | 0.408 | 0.515 |
| 2.117433448519528 | 0.747 | 0.409 | 0.515 |
| 2.120575041173117 | 0.747 | 0.41 | 0.515 |
| 2.123716633826707 | 0.748 | 0.411 | 0.515 |
| 2.126858226480297 | 0.748 | 0.412 | 0.515 |
| 2.129999819133886 | 0.749 | 0.413 | 0.515 |
| 2.133141411787476 | 0.75 | 0.414 | 0.515 |
| 2.136283004441065 | 0.75 | 0.415 | 0.515 |
| 2.139424597094655 | 0.751 | 0.416 | 0.515 |
| 2.142566189748245 | 0.751 | 0.417 | 0.515 |
| 2.145707782401834 | 0.752 | 0.419 | 0.515 |
| 2.148849375055424 | 0.753 | 0.42 | 0.515 |
| 2.151990967709013 | 0.753 | 0.421 | 0.515 |
| 2.155132560362603 | 0.754 | 0.423 | 0.515 |
| 2.158274153016193 | 0.754 | 0.424 | 0.515 |
| 2.161415745669782 | 0.755 | 0.425 | 0.515 |
| 2.164557338323372 | 0.755 | 0.427 | 0.515 |
| 2.167698930976961 | 0.756 | 0.428 | 0.515 |
| 2.170840523630551 | 0.756 | 0.43 | 0.515 |
| 2.173982116284141 | 0.756 | 0.431 | 0.515 |
| 2.17712370893773 | 0.757 | 0.433 | 0.515 |
| 2.18026530159132 | 0.757 | 0.435 | 0.515 |
| 2.183406894244909 | 0.758 | 0.436 | 0.515 |
| 2.186548486898499 | 0.758 | 0.438 | 0.515 |
| 2.189690079552089 | 0.759 | 0.44 | 0.515 |
| 2.192831672205678 | 0.759 | 0.442 | 0.515 |
| 2.195973264859268 | 0.759 | 0.443 | 0.515 |
| 2.199114857512857 | 0.76 | 0.445 | 0.515 |
| 2.202256450166447 | 0.76 | 0.447 | 0.515 |
| 2.205398042820036 | 0.76 | 0.449 | 0.515 |
| 2.208539635473626 | 0.761 | 0.451 | 0.515 |
| 2.211681228127216 | 0.761 | 0.453 | 0.515 |
| 2.214822820780805 | 0.762 | 0.455 | 0.515 |
| 2.217964413434395 | 0.762 | 0.457 | 0.515 |
| 2.221106006087984 | 0.762 | 0.46 | 0.515 |
| 2.224247598741574 | 0.762 | 0.462 | 0.515 |
| 2.227389191395164 | 0.763 | 0.464 | 0.515 |
| 2.230530784048753 | 0.763 | 0.466 | 0.515 |
| 2.233672376702343 | 0.763 | 0.469 | 0.515 |
| 2.236813969355933 | 0.764 | 0.471 | 0.515 |
| 2.239955562009522 | 0.764 | 0.473 | 0.515 |
| 2.243097154663112 | 0.764 | 0.476 | 0.515 |
| 2.246238747316701 | 0.765 | 0.478 | 0.515 |
| 2.249380339970291 | 0.765 | 0.481 | 0.515 |
| 2.252521932623881 | 0.765 | 0.483 | 0.515 |
| 2.25566352527747 | 0.765 | 0.486 | 0.515 |
| 2.25880511793106 | 0.766 | 0.488 | 0.515 |
| 2.261946710584649 | 0.766 | 0.491 | 0.515 |
| 2.265088303238239 | 0.766 | 0.494 | 0.515 |
| 2.268229895891829 | 0.766 | 0.496 | 0.515 |
| 2.271371488545418 | 0.766 | 0.499 | 0.515 |
| 2.274513081199008 | 0.767 | 0.502 | 0.515 |
| 2.277654673852597 | 0.767 | 0.504 | 0.515 |
| 2.280796266506186 | 0.767 | 0.507 | 0.515 |
| 2.283937859159776 | 0.767 | 0.51 | 0.515 |
| 2.287079451813366 | 0.767 | 0.513 | 0.515 |
| 2.290221044466955 | 0.768 | 0.516 | 0.515 |
| 2.293362637120545 | 0.768 | 0.519 | 0.515 |
| 2.296504229774135 | 0.768 | 0.522 | 0.515 |
| 2.299645822427724 | 0.768 | 0.524 | 0.516 |
| 2.302787415081314 | 0.768 | 0.527 | 0.516 |
| 2.305929007734904 | 0.768 | 0.53 | 0.516 |
| 2.309070600388493 | 0.769 | 0.533 | 0.516 |
| 2.312212193042083 | 0.769 | 0.536 | 0.516 |
| 2.315353785695672 | 0.769 | 0.539 | 0.516 |
| 2.318495378349262 | 0.769 | 0.542 | 0.516 |
| 2.321636971002852 | 0.769 | 0.546 | 0.516 |
| 2.324778563656441 | 0.769 | 0.549 | 0.516 |
| 2.327920156310031 | 0.769 | 0.552 | 0.516 |
| 2.33106174896362 | 0.77 | 0.555 | 0.516 |
| 2.33420334161721 | 0.77 | 0.558 | 0.516 |
| 2.3373449342708 | 0.77 | 0.561 | 0.516 |
| 2.340486526924389 | 0.77 | 0.564 | 0.516 |
| 2.343628119577979 | 0.77 | 0.567 | 0.516 |
| 2.346769712231568 | 0.77 | 0.57 | 0.516 |
| 2.349911304885158 | 0.77 | 0.574 | 0.516 |
| 2.353052897538748 | 0.77 | 0.577 | 0.516 |
| 2.356194490192337 | 0.77 | 0.58 | 0.516 |
| 2.359336082845927 | 0.771 | 0.583 | 0.516 |
| 2.362477675499516 | 0.771 | 0.586 | 0.517 |
| 2.365619268153106 | 0.771 | 0.589 | 0.517 |
| 2.368760860806696 | 0.771 | 0.592 | 0.517 |
| 2.371902453460285 | 0.771 | 0.596 | 0.517 |
| 2.375044046113875 | 0.771 | 0.599 | 0.517 |
| 2.378185638767464 | 0.771 | 0.602 | 0.517 |
| 2.381327231421054 | 0.771 | 0.605 | 0.517 |
| 2.384468824074644 | 0.771 | 0.608 | 0.518 |
| 2.387610416728233 | 0.771 | 0.611 | 0.518 |
| 2.390752009381823 | 0.771 | 0.614 | 0.518 |
| 2.393893602035412 | 0.771 | 0.617 | 0.518 |
| 2.397035194689002 | 0.772 | 0.62 | 0.519 |
| 2.400176787342591 | 0.772 | 0.623 | 0.519 |
| 2.403318379996181 | 0.772 | 0.626 | 0.519 |
| 2.406459972649771 | 0.772 | 0.629 | 0.52 |
| 2.40960156530336 | 0.772 | 0.632 | 0.52 |
| 2.41274315795695 | 0.772 | 0.635 | 0.52 |
| 2.41588475061054 | 0.772 | 0.638 | 0.521 |
| 2.419026343264129 | 0.772 | 0.641 | 0.521 |
| 2.422167935917719 | 0.772 | 0.644 | 0.522 |
| 2.425309528571308 | 0.772 | 0.647 | 0.522 |
| 2.428451121224898 | 0.772 | 0.65 | 0.523 |
| 2.431592713878488 | 0.772 | 0.652 | 0.523 |
| 2.434734306532077 | 0.772 | 0.655 | 0.524 |
| 2.437875899185667 | 0.772 | 0.658 | 0.525 |
| 2.441017491839256 | 0.772 | 0.661 | 0.525 |
| 2.444159084492846 | 0.772 | 0.663 | 0.526 |
| 2.447300677146435 | 0.772 | 0.666 | 0.527 |
| 2.450442269800025 | 0.772 | 0.669 | 0.528 |
| 2.453583862453615 | 0.772 | 0.671 | 0.529 |
| 2.456725455107204 | 0.772 | 0.674 | 0.529 |
| 2.459867047760794 | 0.772 | 0.677 | 0.53 |
| 2.463008640414384 | 0.772 | 0.679 | 0.531 |
| 2.466150233067973 | 0.772 | 0.682 | 0.532 |
| 2.469291825721563 | 0.773 | 0.684 | 0.534 |
| 2.472433418375152 | 0.773 | 0.686 | 0.535 |
| 2.475575011028742 | 0.773 | 0.689 | 0.536 |
| 2.478716603682332 | 0.773 | 0.691 | 0.537 |
| 2.481858196335921 | 0.773 | 0.693 | 0.538 |
| 2.48499978898951 | 0.773 | 0.696 | 0.54 |
| 2.4881413816431 | 0.773 | 0.698 | 0.541 |
| 2.49128297429669 | 0.773 | 0.7 | 0.543 |
| 2.49442456695028 | 0.773 | 0.702 | 0.544 |
| 2.497566159603869 | 0.773 | 0.704 | 0.546 |
| 2.500707752257458 | 0.773 | 0.706 | 0.547 |
| 2.503849344911048 | 0.773 | 0.708 | 0.549 |
| 2.506990937564638 | 0.773 | 0.71 | 0.551 |
| 2.510132530218228 | 0.773 | 0.712 | 0.553 |
| 2.513274122871817 | 0.773 | 0.714 | 0.555 |
| 2.516415715525407 | 0.773 | 0.716 | 0.557 |
| 2.519557308178996 | 0.773 | 0.718 | 0.559 |
| 2.522698900832586 | 0.773 | 0.72 | 0.561 |
| 2.525840493486176 | 0.773 | 0.722 | 0.563 |
| 2.528982086139765 | 0.773 | 0.723 | 0.565 |
| 2.532123678793355 | 0.773 | 0.725 | 0.567 |
| 2.535265271446944 | 0.773 | 0.727 | 0.569 |
| 2.538406864100534 | 0.773 | 0.728 | 0.572 |
| 2.541548456754124 | 0.773 | 0.73 | 0.574 |
| 2.544690049407713 | 0.773 | 0.731 | 0.576 |
| 2.547831642061302 | 0.773 | 0.733 | 0.579 |
| 2.550973234714892 | 0.773 | 0.734 | 0.582 |
| 2.554114827368482 | 0.773 | 0.736 | 0.584 |
| 2.557256420022072 | 0.773 | 0.737 | 0.587 |
| 2.560398012675661 | 0.773 | 0.739 | 0.589 |
| 2.563539605329251 | 0.773 | 0.74 | 0.592 |
| 2.56668119798284 | 0.773 | 0.741 | 0.595 |
| 2.56982279063643 | 0.773 | 0.742 | 0.598 |
| 2.57296438329002 | 0.773 | 0.744 | 0.601 |
| 2.576105975943609 | 0.773 | 0.745 | 0.603 |
| 2.579247568597199 | 0.773 | 0.746 | 0.606 |
| 2.582389161250788 | 0.773 | 0.747 | 0.609 |
| 2.585530753904377 | 0.773 | 0.748 | 0.612 |
| 2.588672346557967 | 0.773 | 0.749 | 0.615 |
| 2.591813939211557 | 0.773 | 0.75 | 0.618 |
| 2.594955531865147 | 0.773 | 0.751 | 0.621 |
| 2.598097124518736 | 0.773 | 0.752 | 0.624 |
| 2.601238717172326 | 0.773 | 0.753 | 0.628 |
| 2.604380309825915 | 0.773 | 0.754 | 0.631 |
| 2.607521902479505 | 0.773 | 0.755 | 0.634 |
| 2.610663495133095 | 0.773 | 0.755 | 0.637 |
| 2.613805087786684 | 0.773 | 0.756 | 0.64 |
| 2.616946680440274 | 0.773 | 0.757 | 0.643 |
| 2.620088273093863 | 0.773 | 0.758 | 0.646 |
| 2.623229865747452 | 0.773 | 0.759 | 0.65 |
| 2.626371458401042 | 0.773 | 0.759 | 0.653 |
| 2.629513051054632 | 0.773 | 0.76 | 0.656 |
| 2.632654643708222 | 0.773 | 0.76 | 0.659 |
| 2.635796236361811 | 0.773 | 0.761 | 0.662 |
| 2.638937829015401 | 0.773 | 0.762 | 0.665 |
| 2.642079421668991 | 0.773 | 0.762 | 0.668 |
| 2.64522101432258 | 0.773 | 0.763 | 0.671 |
| 2.64836260697617 | 0.773 | 0.763 | 0.674 |
| 2.651504199629759 | 0.773 | 0.764 | 0.677 |
| 2.654645792283349 | 0.773 | 0.764 | 0.68 |
| 2.657787384936938 | 0.773 | 0.765 | 0.683 |
| 2.660928977590528 | 0.773 | 0.765 | 0.686 |
| 2.664070570244118 | 0.773 | 0.766 | 0.689 |
| 2.667212162897707 | 0.773 | 0.766 | 0.692 |
| 2.670353755551297 | 0.773 | 0.766 | 0.695 |
| 2.673495348204887 | 0.773 | 0.767 | 0.697 |
| 2.676636940858476 | 0.773 | 0.767 | 0.7 |
| 2.679778533512066 | 0.773 | 0.767 | 0.703 |
| 2.682920126165655 | 0.773 | 0.768 | 0.705 |
| 2.686061718819245 | 0.773 | 0.768 | 0.708 |
| 2.689203311472835 | 0.773 | 0.768 | 0.71 |
| 2.692344904126424 | 0.773 | 0.769 | 0.713 |
| 2.695486496780014 | 0.773 | 0.769 | 0.715 |
| 2.698628089433603 | 0.773 | 0.769 | 0.718 |
| 2.701769682087193 | 0.773 | 0.769 | 0.72 |
| 2.704911274740782 | 0.773 | 0.77 | 0.722 |
| 2.708052867394372 | 0.773 | 0.77 | 0.724 |
| 2.711194460047962 | 0.773 | 0.77 | 0.727 |
| 2.714336052701551 | 0.773 | 0.77 | 0.729 |
| 2.717477645355141 | 0.773 | 0.77 | 0.731 |
| 2.720619238008731 | 0.773 | 0.771 | 0.733 |
| 2.72376083066232 | 0.773 | 0.771 | 0.735 |
| 2.72690242331591 | 0.773 | 0.771 | 0.736 |
| 2.730044015969499 | 0.773 | 0.771 | 0.738 |
| 2.733185608623089 | 0.773 | 0.771 | 0.74 |
| 2.736327201276678 | 0.773 | 0.771 | 0.742 |
| 2.739468793930268 | 0.773 | 0.771 | 0.743 |
| 2.742610386583858 | 0.773 | 0.772 | 0.745 |
| 2.745751979237447 | 0.773 | 0.772 | 0.746 |
| 2.748893571891036 | 0.773 | 0.772 | 0.748 |
| 2.752035164544627 | 0.773 | 0.772 | 0.749 |
| 2.755176757198216 | 0.773 | 0.772 | 0.75 |
| 2.758318349851806 | 0.773 | 0.772 | 0.752 |
| 2.761459942505395 | 0.773 | 0.772 | 0.753 |
| 2.764601535158985 | 0.773 | 0.772 | 0.754 |
| 2.767743127812574 | 0.773 | 0.772 | 0.755 |
| 2.770884720466164 | 0.773 | 0.772 | 0.756 |
| 2.774026313119754 | 0.773 | 0.772 | 0.757 |
| 2.777167905773343 | 0.773 | 0.772 | 0.758 |
| 2.780309498426932 | 0.773 | 0.773 | 0.759 |
| 2.783451091080522 | 0.773 | 0.773 | 0.76 |
| 2.786592683734112 | 0.773 | 0.773 | 0.761 |
| 2.789734276387701 | 0.773 | 0.773 | 0.762 |
| 2.792875869041291 | 0.773 | 0.773 | 0.763 |
| 2.796017461694881 | 0.773 | 0.773 | 0.763 |
| 2.79915905434847 | 0.773 | 0.773 | 0.764 |
| 2.80230064700206 | 0.773 | 0.773 | 0.765 |
| 2.80544223965565 | 0.773 | 0.773 | 0.765 |
| 2.808583832309239 | 0.773 | 0.773 | 0.766 |
| 2.811725424962829 | 0.773 | 0.773 | 0.766 |
| 2.814867017616419 | 0.773 | 0.773 | 0.767 |
| 2.818008610270008 | 0.773 | 0.773 | 0.767 |
| 2.821150202923598 | 0.773 | 0.773 | 0.768 |
| 2.824291795577187 | 0.773 | 0.773 | 0.768 |
| 2.827433388230777 | 0.773 | 0.773 | 0.769 |
| 2.830574980884366 | 0.773 | 0.773 | 0.769 |
| 2.833716573537956 | 0.773 | 0.773 | 0.769 |
| 2.836858166191546 | 0.773 | 0.773 | 0.77 |
| 2.839999758845135 | 0.773 | 0.773 | 0.77 |
| 2.843141351498725 | 0.773 | 0.773 | 0.77 |
| 2.846282944152314 | 0.773 | 0.773 | 0.771 |
| 2.849424536805904 | 0.773 | 0.773 | 0.771 |
| 2.852566129459494 | 0.773 | 0.773 | 0.771 |
| 2.855707722113083 | 0.773 | 0.773 | 0.771 |
| 2.858849314766673 | 0.773 | 0.773 | 0.771 |
| 2.861990907420262 | 0.773 | 0.773 | 0.772 |
| 2.865132500073852 | 0.773 | 0.773 | 0.772 |
| 2.868274092727442 | 0.773 | 0.773 | 0.772 |
| 2.871415685381031 | 0.773 | 0.773 | 0.772 |
| 2.874557278034621 | 0.773 | 0.773 | 0.772 |
| 2.87769887068821 | 0.773 | 0.773 | 0.772 |
| 2.8808404633418 | 0.773 | 0.773 | 0.772 |
| 2.88398205599539 | 0.773 | 0.773 | 0.772 |
| 2.88712364864898 | 0.773 | 0.773 | 0.772 |
| 2.890265241302569 | 0.773 | 0.773 | 0.773 |
| 2.893406833956158 | 0.773 | 0.773 | 0.773 |
| 2.896548426609748 | 0.773 | 0.773 | 0.773 |
| 2.899690019263338 | 0.773 | 0.773 | 0.773 |
| 2.902831611916927 | 0.773 | 0.773 | 0.773 |
| 2.905973204570517 | 0.773 | 0.773 | 0.773 |
| 2.909114797224106 | 0.773 | 0.773 | 0.773 |
| 2.912256389877696 | 0.773 | 0.773 | 0.773 |
| 2.915397982531286 | 0.773 | 0.773 | 0.773 |
| 2.918539575184875 | 0.773 | 0.773 | 0.773 |
| 2.921681167838465 | 0.773 | 0.773 | 0.773 |
| 2.924822760492054 | 0.773 | 0.773 | 0.773 |
| 2.927964353145644 | 0.773 | 0.773 | 0.773 |
| 2.931105945799234 | 0.773 | 0.773 | 0.773 |
| 2.934247538452823 | 0.773 | 0.773 | 0.773 |
| 2.937389131106413 | 0.773 | 0.773 | 0.773 |
| 2.940530723760002 | 0.773 | 0.773 | 0.773 |
| 2.943672316413592 | 0.773 | 0.773 | 0.773 |
| 2.946813909067182 | 0.773 | 0.773 | 0.773 |
| 2.949955501720771 | 0.773 | 0.773 | 0.773 |
| 2.953097094374361 | 0.773 | 0.773 | 0.773 |
| 2.95623868702795 | 0.773 | 0.773 | 0.773 |
| 2.95938027968154 | 0.773 | 0.773 | 0.773 |
| 2.96252187233513 | 0.773 | 0.773 | 0.773 |
| 2.965663464988719 | 0.773 | 0.773 | 0.773 |
| 2.968805057642309 | 0.773 | 0.773 | 0.773 |
| 2.971946650295898 | 0.773 | 0.773 | 0.773 |
| 2.975088242949488 | 0.773 | 0.773 | 0.773 |
| 2.978229835603078 | 0.773 | 0.773 | 0.773 |
| 2.981371428256667 | 0.773 | 0.773 | 0.773 |
| 2.984513020910257 | 0.773 | 0.773 | 0.773 |
| 2.987654613563846 | 0.773 | 0.773 | 0.773 |
| 2.990796206217436 | 0.773 | 0.773 | 0.773 |
| 2.993937798871025 | 0.773 | 0.773 | 0.773 |
| 2.997079391524615 | 0.773 | 0.773 | 0.773 |
| 3.000220984178205 | 0.773 | 0.773 | 0.773 |
| 3.003362576831794 | 0.773 | 0.773 | 0.773 |
| 3.006504169485384 | 0.773 | 0.773 | 0.773 |
| 3.009645762138974 | 0.773 | 0.773 | 0.773 |
| 3.012787354792563 | 0.773 | 0.773 | 0.773 |
| 3.015928947446153 | 0.773 | 0.773 | 0.773 |
| 3.019070540099742 | 0.773 | 0.773 | 0.773 |
| 3.022212132753332 | 0.773 | 0.773 | 0.773 |
| 3.025353725406922 | 0.773 | 0.773 | 0.773 |
| 3.028495318060511 | 0.773 | 0.773 | 0.773 |
| 3.031636910714101 | 0.773 | 0.773 | 0.773 |
| 3.03477850336769 | 0.773 | 0.773 | 0.773 |
| 3.03792009602128 | 0.773 | 0.773 | 0.773 |
| 3.04106168867487 | 0.773 | 0.773 | 0.773 |
| 3.04420328132846 | 0.773 | 0.773 | 0.773 |
| 3.047344873982049 | 0.773 | 0.773 | 0.773 |
| 3.050486466635638 | 0.773 | 0.773 | 0.773 |
| 3.053628059289228 | 0.773 | 0.773 | 0.773 |
| 3.056769651942818 | 0.773 | 0.773 | 0.773 |
| 3.059911244596407 | 0.773 | 0.773 | 0.773 |
| 3.063052837249997 | 0.773 | 0.773 | 0.773 |
| 3.066194429903586 | 0.773 | 0.773 | 0.773 |
| 3.069336022557176 | 0.773 | 0.773 | 0.773 |
| 3.072477615210766 | 0.773 | 0.773 | 0.773 |
| 3.075619207864355 | 0.773 | 0.773 | 0.773 |
| 3.078760800517945 | 0.773 | 0.773 | 0.773 |
| 3.081902393171534 | 0.773 | 0.773 | 0.773 |
| 3.085043985825124 | 0.773 | 0.773 | 0.773 |
| 3.088185578478713 | 0.773 | 0.773 | 0.773 |
| 3.091327171132303 | 0.773 | 0.773 | 0.773 |
| 3.094468763785893 | 0.773 | 0.773 | 0.773 |
| 3.097610356439482 | 0.773 | 0.773 | 0.773 |
| 3.100751949093072 | 0.773 | 0.773 | 0.773 |
| 3.103893541746661 | 0.773 | 0.773 | 0.773 |
| 3.107035134400251 | 0.773 | 0.773 | 0.773 |
| 3.110176727053841 | 0.773 | 0.773 | 0.773 |
| 3.11331831970743 | 0.773 | 0.773 | 0.773 |
| 3.11645991236102 | 0.773 | 0.773 | 0.773 |
| 3.11960150501461 | 0.773 | 0.773 | 0.773 |
| 3.122743097668199 | 0.773 | 0.773 | 0.773 |
| 3.125884690321789 | 0.773 | 0.773 | 0.773 |
| 3.129026282975378 | 0.773 | 0.773 | 0.773 |
| 3.132167875628968 | 0.773 | 0.773 | 0.773 |
| 3.135309468282557 | 0.773 | 0.773 | 0.773 |
| 3.138451060936147 | 0.773 | 0.773 | 0.773 |
| 3.141592653589737 | 0.773 | 0.773 | 0.773 |
| 3.144734246243326 | 0.773 | 0.773 | 0.773 |
| 3.147875838896916 | 0.773 | 0.773 | 0.773 |
| 3.151017431550505 | 0.773 | 0.773 | 0.773 |
| 3.154159024204095 | 0.773 | 0.773 | 0.773 |
| 3.157300616857685 | 0.773 | 0.773 | 0.773 |
| 3.160442209511274 | 0.773 | 0.773 | 0.773 |
| 3.163583802164864 | 0.773 | 0.773 | 0.773 |
| 3.166725394818453 | 0.773 | 0.773 | 0.773 |
| 3.169866987472043 | 0.773 | 0.773 | 0.773 |
| 3.173008580125633 | 0.773 | 0.773 | 0.773 |
| 3.176150172779222 | 0.773 | 0.773 | 0.773 |
| 3.179291765432812 | 0.773 | 0.773 | 0.773 |
| 3.182433358086401 | 0.773 | 0.773 | 0.773 |
| 3.185574950739991 | 0.773 | 0.773 | 0.773 |
| 3.188716543393581 | 0.773 | 0.773 | 0.773 |
| 3.19185813604717 | 0.773 | 0.773 | 0.773 |
| 3.19499972870076 | 0.773 | 0.773 | 0.773 |
| 3.198141321354349 | 0.773 | 0.773 | 0.773 |
| 3.20128291400794 | 0.773 | 0.773 | 0.773 |
| 3.204424506661528 | 0.773 | 0.773 | 0.773 |
| 3.207566099315118 | 0.773 | 0.773 | 0.773 |
| 3.210707691968708 | 0.773 | 0.773 | 0.773 |
| 3.213849284622297 | 0.773 | 0.773 | 0.773 |
| 3.216990877275887 | 0.773 | 0.773 | 0.773 |
| 3.220132469929476 | 0.773 | 0.773 | 0.773 |
| 3.223274062583066 | 0.773 | 0.773 | 0.773 |
| 3.226415655236656 | 0.773 | 0.773 | 0.773 |
| 3.229557247890245 | 0.773 | 0.773 | 0.773 |
| 3.232698840543835 | 0.773 | 0.773 | 0.773 |
| 3.235840433197425 | 0.773 | 0.773 | 0.773 |
| 3.238982025851014 | 0.773 | 0.773 | 0.773 |
| 3.242123618504604 | 0.773 | 0.773 | 0.773 |
| 3.245265211158193 | 0.773 | 0.773 | 0.773 |
| 3.248406803811783 | 0.773 | 0.773 | 0.773 |
| 3.251548396465373 | 0.773 | 0.773 | 0.773 |
| 3.254689989118962 | 0.773 | 0.773 | 0.773 |
| 3.257831581772551 | 0.773 | 0.773 | 0.773 |
| 3.260973174426141 | 0.773 | 0.773 | 0.773 |
| 3.26411476707973 | 0.773 | 0.773 | 0.773 |
| 3.267256359733321 | 0.773 | 0.773 | 0.773 |
| 3.27039795238691 | 0.773 | 0.773 | 0.773 |
| 3.2735395450405 | 0.773 | 0.773 | 0.773 |
| 3.276681137694089 | 0.773 | 0.773 | 0.773 |
| 3.279822730347679 | 0.773 | 0.773 | 0.773 |
| 3.282964323001269 | 0.773 | 0.773 | 0.773 |
| 3.286105915654858 | 0.773 | 0.773 | 0.773 |
| 3.289247508308448 | 0.773 | 0.773 | 0.773 |
| 3.292389100962037 | 0.773 | 0.773 | 0.773 |
| 3.295530693615627 | 0.773 | 0.773 | 0.773 |
| 3.298672286269217 | 0.773 | 0.773 | 0.773 |
| 3.301813878922806 | 0.773 | 0.773 | 0.773 |
| 3.304955471576396 | 0.773 | 0.773 | 0.773 |
| 3.308097064229985 | 0.773 | 0.773 | 0.773 |
| 3.311238656883575 | 0.773 | 0.773 | 0.773 |
| 3.314380249537165 | 0.773 | 0.773 | 0.773 |
| 3.317521842190754 | 0.773 | 0.773 | 0.773 |
| 3.320663434844344 | 0.773 | 0.773 | 0.773 |
| 3.323805027497933 | 0.773 | 0.773 | 0.773 |
| 3.326946620151523 | 0.773 | 0.773 | 0.773 |
| 3.330088212805113 | 0.773 | 0.773 | 0.773 |
| 3.333229805458702 | 0.773 | 0.773 | 0.773 |
| 3.336371398112292 | 0.773 | 0.773 | 0.773 |
| 3.339512990765881 | 0.773 | 0.773 | 0.773 |
| 3.342654583419471 | 0.773 | 0.773 | 0.773 |
| 3.345796176073061 | 0.773 | 0.773 | 0.773 |
| 3.34893776872665 | 0.773 | 0.773 | 0.773 |
| 3.35207936138024 | 0.773 | 0.773 | 0.773 |
| 3.355220954033829 | 0.773 | 0.773 | 0.773 |
| 3.358362546687419 | 0.773 | 0.773 | 0.773 |
| 3.361504139341009 | 0.773 | 0.773 | 0.773 |
| 3.364645731994598 | 0.773 | 0.773 | 0.773 |
| 3.367787324648188 | 0.773 | 0.773 | 0.773 |
| 3.370928917301777 | 0.773 | 0.773 | 0.773 |
| 3.374070509955367 | 0.773 | 0.773 | 0.773 |
| 3.377212102608956 | 0.773 | 0.773 | 0.773 |
| 3.380353695262546 | 0.773 | 0.773 | 0.773 |
| 3.383495287916136 | 0.773 | 0.773 | 0.774 |
| 3.386636880569725 | 0.773 | 0.773 | 0.774 |
| 3.389778473223315 | 0.773 | 0.773 | 0.774 |
| 3.392920065876904 | 0.773 | 0.773 | 0.774 |
| 3.396061658530494 | 0.773 | 0.773 | 0.774 |
| 3.399203251184084 | 0.773 | 0.773 | 0.774 |
| 3.402344843837673 | 0.773 | 0.773 | 0.774 |
| 3.405486436491263 | 0.773 | 0.773 | 0.774 |
| 3.408628029144852 | 0.773 | 0.773 | 0.774 |
| 3.411769621798442 | 0.773 | 0.773 | 0.774 |
| 3.414911214452032 | 0.773 | 0.773 | 0.774 |
| 3.418052807105621 | 0.773 | 0.773 | 0.775 |
| 3.421194399759211 | 0.773 | 0.773 | 0.775 |
| 3.4243359924128 | 0.773 | 0.773 | 0.775 |
| 3.42747758506639 | 0.773 | 0.773 | 0.775 |
| 3.43061917771998 | 0.773 | 0.773 | 0.775 |
| 3.433760770373569 | 0.773 | 0.773 | 0.776 |
| 3.436902363027159 | 0.773 | 0.773 | 0.776 |
| 3.440043955680748 | 0.773 | 0.773 | 0.776 |
| 3.443185548334338 | 0.773 | 0.773 | 0.776 |
| 3.446327140987927 | 0.773 | 0.773 | 0.777 |
| 3.449468733641517 | 0.773 | 0.773 | 0.777 |
| 3.452610326295107 | 0.773 | 0.773 | 0.777 |
| 3.455751918948696 | 0.773 | 0.773 | 0.778 |
| 3.458893511602286 | 0.773 | 0.773 | 0.778 |
| 3.462035104255876 | 0.773 | 0.773 | 0.778 |
| 3.465176696909465 | 0.773 | 0.773 | 0.779 |
| 3.468318289563055 | 0.773 | 0.773 | 0.779 |
| 3.471459882216644 | 0.773 | 0.773 | 0.78 |
| 3.474601474870234 | 0.773 | 0.773 | 0.78 |
| 3.477743067523824 | 0.773 | 0.773 | 0.781 |
| 3.480884660177413 | 0.773 | 0.773 | 0.782 |
| 3.484026252831002 | 0.773 | 0.773 | 0.782 |
| 3.487167845484592 | 0.773 | 0.774 | 0.783 |
| 3.490309438138182 | 0.773 | 0.774 | 0.784 |
| 3.493451030791772 | 0.773 | 0.774 | 0.784 |
| 3.496592623445361 | 0.773 | 0.774 | 0.785 |
| 3.499734216098951 | 0.773 | 0.774 | 0.786 |
| 3.50287580875254 | 0.773 | 0.774 | 0.787 |
| 3.50601740140613 | 0.773 | 0.774 | 0.788 |
| 3.50915899405972 | 0.773 | 0.774 | 0.789 |
| 3.512300586713309 | 0.773 | 0.774 | 0.79 |
| 3.515442179366899 | 0.773 | 0.774 | 0.791 |
| 3.518583772020488 | 0.773 | 0.774 | 0.792 |
| 3.521725364674078 | 0.773 | 0.774 | 0.793 |
| 3.524866957327668 | 0.773 | 0.774 | 0.794 |
| 3.528008549981257 | 0.773 | 0.774 | 0.796 |
| 3.531150142634847 | 0.773 | 0.774 | 0.797 |
| 3.534291735288436 | 0.773 | 0.774 | 0.798 |
| 3.537433327942026 | 0.773 | 0.775 | 0.8 |
| 3.540574920595616 | 0.773 | 0.775 | 0.801 |
| 3.543716513249205 | 0.773 | 0.775 | 0.803 |
| 3.546858105902795 | 0.773 | 0.775 | 0.805 |
| 3.549999698556384 | 0.773 | 0.775 | 0.806 |
| 3.553141291209974 | 0.773 | 0.775 | 0.808 |
| 3.556282883863564 | 0.773 | 0.775 | 0.81 |
| 3.559424476517153 | 0.773 | 0.775 | 0.812 |
| 3.562566069170743 | 0.773 | 0.776 | 0.814 |
| 3.565707661824332 | 0.773 | 0.776 | 0.816 |
| 3.568849254477922 | 0.773 | 0.776 | 0.818 |
| 3.571990847131511 | 0.773 | 0.776 | 0.82 |
| 3.575132439785101 | 0.773 | 0.776 | 0.822 |
| 3.578274032438691 | 0.773 | 0.777 | 0.824 |
| 3.58141562509228 | 0.773 | 0.777 | 0.826 |
| 3.58455721774587 | 0.773 | 0.777 | 0.829 |
| 3.58769881039946 | 0.773 | 0.777 | 0.831 |
| 3.590840403053049 | 0.773 | 0.778 | 0.833 |
| 3.593981995706639 | 0.773 | 0.778 | 0.836 |
| 3.597123588360228 | 0.773 | 0.778 | 0.838 |
| 3.600265181013818 | 0.773 | 0.778 | 0.841 |
| 3.603406773667407 | 0.773 | 0.779 | 0.844 |
| 3.606548366320997 | 0.773 | 0.779 | 0.846 |
| 3.609689958974587 | 0.773 | 0.779 | 0.849 |
| 3.612831551628176 | 0.773 | 0.78 | 0.852 |
| 3.615973144281766 | 0.773 | 0.78 | 0.854 |
| 3.619114736935355 | 0.773 | 0.781 | 0.857 |
| 3.622256329588945 | 0.773 | 0.781 | 0.86 |
| 3.625397922242534 | 0.773 | 0.781 | 0.863 |
| 3.628539514896124 | 0.773 | 0.782 | 0.866 |
| 3.631681107549714 | 0.773 | 0.782 | 0.869 |
| 3.634822700203303 | 0.773 | 0.783 | 0.872 |
| 3.637964292856893 | 0.773 | 0.783 | 0.875 |
| 3.641105885510483 | 0.773 | 0.784 | 0.878 |
| 3.644247478164072 | 0.773 | 0.785 | 0.881 |
| 3.647389070817662 | 0.773 | 0.785 | 0.884 |
| 3.650530663471251 | 0.773 | 0.786 | 0.887 |
| 3.653672256124841 | 0.773 | 0.786 | 0.89 |
| 3.656813848778431 | 0.773 | 0.787 | 0.894 |
| 3.65995544143202 | 0.773 | 0.788 | 0.897 |
| 3.66309703408561 | 0.773 | 0.788 | 0.9 |
| 3.666238626739199 | 0.773 | 0.789 | 0.903 |
| 3.66938021939279 | 0.773 | 0.79 | 0.906 |
| 3.672521812046378 | 0.773 | 0.791 | 0.909 |
| 3.675663404699968 | 0.773 | 0.792 | 0.912 |
| 3.678804997353558 | 0.773 | 0.792 | 0.916 |
| 3.681946590007147 | 0.773 | 0.793 | 0.919 |
| 3.685088182660737 | 0.773 | 0.794 | 0.922 |
| 3.688229775314326 | 0.773 | 0.795 | 0.925 |
| 3.691371367967916 | 0.773 | 0.796 | 0.928 |
| 3.694512960621506 | 0.773 | 0.797 | 0.931 |
| 3.697654553275095 | 0.773 | 0.798 | 0.934 |
| 3.700796145928685 | 0.773 | 0.799 | 0.937 |
| 3.703937738582274 | 0.773 | 0.8 | 0.94 |
| 3.707079331235864 | 0.773 | 0.802 | 0.943 |
| 3.710220923889454 | 0.773 | 0.803 | 0.946 |
| 3.713362516543043 | 0.773 | 0.804 | 0.949 |
| 3.716504109196633 | 0.773 | 0.805 | 0.951 |
| 3.719645701850223 | 0.773 | 0.806 | 0.954 |
| 3.722787294503812 | 0.773 | 0.808 | 0.957 |
| 3.725928887157402 | 0.773 | 0.809 | 0.96 |
| 3.729070479810991 | 0.773 | 0.81 | 0.962 |
| 3.732212072464581 | 0.773 | 0.812 | 0.965 |
| 3.735353665118171 | 0.773 | 0.813 | 0.967 |
| 3.73849525777176 | 0.773 | 0.815 | 0.97 |
| 3.74163685042535 | 0.773 | 0.816 | 0.972 |
| 3.744778443078939 | 0.773 | 0.818 | 0.975 |
| 3.747920035732529 | 0.773 | 0.82 | 0.977 |
| 3.751061628386119 | 0.773 | 0.821 | 0.979 |
| 3.754203221039708 | 0.773 | 0.823 | 0.981 |
| 3.757344813693298 | 0.773 | 0.825 | 0.984 |
| 3.760486406346887 | 0.773 | 0.826 | 0.986 |
| 3.763627999000477 | 0.773 | 0.828 | 0.988 |
| 3.766769591654067 | 0.773 | 0.83 | 0.99 |
| 3.769911184307656 | 0.773 | 0.832 | 0.992 |
| 3.773052776961246 | 0.773 | 0.834 | 0.994 |
| 3.776194369614835 | 0.773 | 0.836 | 0.995 |
| 3.779335962268425 | 0.773 | 0.838 | 0.997 |
| 3.782477554922014 | 0.774 | 0.84 | 0.999 |
| 3.785619147575604 | 0.774 | 0.842 | 1 |
| 3.788760740229193 | 0.774 | 0.844 | 1.002 |
| 3.791902332882783 | 0.774 | 0.846 | 1.004 |
| 3.795043925536373 | 0.774 | 0.848 | 1.005 |
| 3.798185518189962 | 0.774 | 0.851 | 1.006 |
| 3.801327110843552 | 0.774 | 0.853 | 1.008 |
| 3.804468703497142 | 0.774 | 0.855 | 1.009 |
| 3.807610296150731 | 0.774 | 0.858 | 1.01 |
| 3.810751888804321 | 0.774 | 0.86 | 1.012 |
| 3.813893481457911 | 0.774 | 0.862 | 1.013 |
| 3.8170350741115 | 0.774 | 0.865 | 1.014 |
| 3.82017666676509 | 0.774 | 0.867 | 1.015 |
| 3.823318259418679 | 0.774 | 0.87 | 1.016 |
| 3.826459852072269 | 0.774 | 0.872 | 1.017 |
| 3.829601444725859 | 0.774 | 0.875 | 1.018 |
| 3.832743037379448 | 0.774 | 0.877 | 1.019 |
| 3.835884630033038 | 0.774 | 0.88 | 1.019 |
| 3.839026222686627 | 0.774 | 0.883 | 1.02 |
| 3.842167815340217 | 0.774 | 0.885 | 1.021 |
| 3.845309407993807 | 0.774 | 0.888 | 1.022 |
| 3.848451000647396 | 0.774 | 0.891 | 1.022 |
| 3.851592593300986 | 0.774 | 0.894 | 1.023 |
| 3.854734185954575 | 0.774 | 0.897 | 1.023 |
| 3.857875778608165 | 0.774 | 0.899 | 1.024 |
| 3.861017371261755 | 0.774 | 0.902 | 1.024 |
| 3.864158963915344 | 0.774 | 0.905 | 1.025 |
| 3.867300556568933 | 0.774 | 0.908 | 1.025 |
| 3.870442149222523 | 0.774 | 0.911 | 1.026 |
| 3.873583741876112 | 0.775 | 0.914 | 1.026 |
| 3.876725334529703 | 0.775 | 0.917 | 1.027 |
| 3.879866927183292 | 0.775 | 0.92 | 1.027 |
| 3.883008519836882 | 0.775 | 0.923 | 1.027 |
| 3.886150112490471 | 0.775 | 0.926 | 1.028 |
| 3.889291705144061 | 0.775 | 0.929 | 1.028 |
| 3.892433297797651 | 0.775 | 0.932 | 1.028 |
| 3.89557489045124 | 0.775 | 0.935 | 1.028 |
| 3.89871648310483 | 0.775 | 0.938 | 1.029 |
| 3.901858075758419 | 0.775 | 0.941 | 1.029 |
| 3.904999668412009 | 0.775 | 0.944 | 1.029 |
| 3.908141261065598 | 0.775 | 0.948 | 1.029 |
| 3.911282853719188 | 0.775 | 0.951 | 1.029 |
| 3.914424446372778 | 0.775 | 0.954 | 1.029 |
| 3.917566039026367 | 0.776 | 0.957 | 1.03 |
| 3.920707631679957 | 0.776 | 0.96 | 1.03 |
| 3.923849224333547 | 0.776 | 0.963 | 1.03 |
| 3.926990816987136 | 0.776 | 0.966 | 1.03 |
| 3.930132409640726 | 0.776 | 0.97 | 1.03 |
| 3.933274002294315 | 0.776 | 0.973 | 1.03 |
| 3.936415594947905 | 0.776 | 0.976 | 1.03 |
| 3.939557187601495 | 0.776 | 0.979 | 1.03 |
| 3.942698780255084 | 0.776 | 0.982 | 1.03 |
| 3.945840372908674 | 0.776 | 0.985 | 1.03 |
| 3.948981965562263 | 0.777 | 0.988 | 1.03 |
| 3.952123558215853 | 0.777 | 0.991 | 1.03 |
| 3.955265150869442 | 0.777 | 0.995 | 1.031 |
| 3.958406743523032 | 0.777 | 0.998 | 1.031 |
| 3.961548336176622 | 0.777 | 1.001 | 1.031 |
| 3.964689928830211 | 0.777 | 1.004 | 1.031 |
| 3.967831521483801 | 0.777 | 1.007 | 1.031 |
| 3.97097311413739 | 0.777 | 1.01 | 1.031 |
| 3.97411470679098 | 0.778 | 1.013 | 1.031 |
| 3.97725629944457 | 0.778 | 1.016 | 1.031 |
| 3.98039789209816 | 0.778 | 1.019 | 1.031 |
| 3.983539484751749 | 0.778 | 1.022 | 1.031 |
| 3.986681077405338 | 0.778 | 1.025 | 1.031 |
| 3.989822670058928 | 0.778 | 1.028 | 1.031 |
| 3.992964262712517 | 0.779 | 1.031 | 1.031 |
| 3.996105855366107 | 0.779 | 1.033 | 1.031 |
| 3.999247448019697 | 0.779 | 1.036 | 1.031 |
| 4.002389040673287 | 0.779 | 1.039 | 1.031 |
| 4.005530633326877 | 0.779 | 1.042 | 1.031 |
| 4.008672225980466 | 0.78 | 1.045 | 1.031 |
| 4.011813818634056 | 0.78 | 1.047 | 1.031 |
| 4.014955411287645 | 0.78 | 1.05 | 1.031 |
| 4.018097003941234 | 0.78 | 1.053 | 1.031 |
| 4.021238596594824 | 0.781 | 1.055 | 1.031 |
| 4.024380189248414 | 0.781 | 1.058 | 1.031 |
| 4.027521781902004 | 0.781 | 1.061 | 1.031 |
| 4.030663374555593 | 0.781 | 1.063 | 1.031 |
| 4.033804967209183 | 0.781 | 1.066 | 1.031 |
| 4.036946559862773 | 0.782 | 1.068 | 1.031 |
| 4.040088152516362 | 0.782 | 1.071 | 1.031 |
| 4.043229745169951 | 0.782 | 1.073 | 1.031 |
| 4.046371337823541 | 0.783 | 1.075 | 1.031 |
| 4.049512930477131 | 0.783 | 1.078 | 1.031 |
| 4.05265452313072 | 0.783 | 1.08 | 1.031 |
| 4.05579611578431 | 0.783 | 1.082 | 1.031 |
| 4.0589377084379 | 0.784 | 1.084 | 1.031 |
| 4.062079301091489 | 0.784 | 1.087 | 1.031 |
| 4.065220893745079 | 0.784 | 1.089 | 1.031 |
| 4.068362486398668 | 0.785 | 1.091 | 1.031 |
| 4.071504079052258 | 0.785 | 1.093 | 1.031 |
| 4.074645671705848 | 0.785 | 1.095 | 1.031 |
| 4.077787264359437 | 0.786 | 1.097 | 1.031 |
| 4.080928857013027 | 0.786 | 1.099 | 1.031 |
| 4.084070449666616 | 0.787 | 1.101 | 1.031 |
| 4.087212042320206 | 0.787 | 1.103 | 1.031 |
| 4.090353634973795 | 0.787 | 1.105 | 1.031 |
| 4.093495227627385 | 0.788 | 1.106 | 1.031 |
| 4.096636820280975 | 0.788 | 1.108 | 1.031 |
| 4.099778412934564 | 0.789 | 1.11 | 1.031 |
| 4.102920005588154 | 0.789 | 1.112 | 1.031 |
| 4.106061598241744 | 0.789 | 1.113 | 1.031 |
| 4.109203190895333 | 0.79 | 1.115 | 1.031 |
| 4.112344783548923 | 0.79 | 1.116 | 1.031 |
| 4.115486376202512 | 0.791 | 1.118 | 1.031 |
| 4.118627968856102 | 0.791 | 1.119 | 1.031 |
| 4.121769561509692 | 0.792 | 1.121 | 1.031 |
| 4.124911154163281 | 0.792 | 1.122 | 1.031 |
| 4.128052746816871 | 0.793 | 1.124 | 1.031 |
| 4.13119433947046 | 0.793 | 1.125 | 1.031 |
| 4.13433593212405 | 0.794 | 1.126 | 1.031 |
| 4.13747752477764 | 0.794 | 1.128 | 1.031 |
| 4.14061911743123 | 0.795 | 1.129 | 1.031 |
| 4.143760710084818 | 0.795 | 1.13 | 1.031 |
| 4.146902302738408 | 0.796 | 1.131 | 1.031 |
| 4.150043895391998 | 0.797 | 1.132 | 1.031 |
| 4.153185488045588 | 0.797 | 1.134 | 1.031 |
| 4.156327080699177 | 0.798 | 1.135 | 1.031 |
| 4.159468673352766 | 0.798 | 1.136 | 1.031 |
| 4.162610266006356 | 0.799 | 1.137 | 1.031 |
| 4.165751858659946 | 0.8 | 1.138 | 1.031 |
| 4.168893451313535 | 0.8 | 1.139 | 1.031 |
| 4.172035043967125 | 0.801 | 1.139 | 1.031 |
| 4.175176636620715 | 0.802 | 1.14 | 1.031 |
| 4.178318229274304 | 0.802 | 1.141 | 1.031 |
| 4.181459821927894 | 0.803 | 1.142 | 1.031 |
| 4.184601414581484 | 0.804 | 1.143 | 1.031 |
| 4.187743007235073 | 0.805 | 1.144 | 1.031 |
| 4.190884599888663 | 0.805 | 1.144 | 1.031 |
| 4.194026192542252 | 0.806 | 1.145 | 1.031 |
| 4.197167785195842 | 0.807 | 1.146 | 1.031 |
| 4.200309377849432 | 0.808 | 1.146 | 1.031 |
| 4.203450970503021 | 0.808 | 1.147 | 1.031 |
| 4.206592563156611 | 0.809 | 1.148 | 1.031 |
| 4.2097341558102 | 0.81 | 1.148 | 1.031 |
| 4.21287574846379 | 0.811 | 1.149 | 1.031 |
| 4.21601734111738 | 0.812 | 1.149 | 1.031 |
| 4.21915893377097 | 0.813 | 1.15 | 1.031 |
| 4.222300526424559 | 0.814 | 1.15 | 1.031 |
| 4.225442119078148 | 0.814 | 1.151 | 1.031 |
| 4.228583711731738 | 0.815 | 1.151 | 1.031 |
| 4.231725304385327 | 0.816 | 1.152 | 1.031 |
| 4.234866897038917 | 0.817 | 1.152 | 1.031 |
| 4.238008489692506 | 0.818 | 1.153 | 1.031 |
| 4.241150082346096 | 0.819 | 1.153 | 1.031 |
| 4.244291674999685 | 0.82 | 1.153 | 1.031 |
| 4.247433267653276 | 0.821 | 1.154 | 1.031 |
| 4.250574860306865 | 0.822 | 1.154 | 1.031 |
| 4.253716452960455 | 0.823 | 1.154 | 1.031 |
| 4.256858045614044 | 0.824 | 1.155 | 1.031 |
| 4.259999638267634 | 0.825 | 1.155 | 1.031 |
| 4.263141230921224 | 0.827 | 1.155 | 1.031 |
| 4.266282823574813 | 0.828 | 1.156 | 1.031 |
| 4.269424416228403 | 0.829 | 1.156 | 1.031 |
| 4.272566008881992 | 0.83 | 1.156 | 1.031 |
| 4.275707601535582 | 0.831 | 1.156 | 1.031 |
| 4.27884919418917 | 0.832 | 1.156 | 1.031 |
| 4.28199078684276 | 0.833 | 1.157 | 1.031 |
| 4.285132379496351 | 0.835 | 1.157 | 1.031 |
| 4.28827397214994 | 0.836 | 1.157 | 1.031 |
| 4.29141556480353 | 0.837 | 1.157 | 1.031 |
| 4.294557157457119 | 0.838 | 1.157 | 1.031 |
| 4.29769875011071 | 0.84 | 1.158 | 1.031 |
| 4.300840342764299 | 0.841 | 1.158 | 1.031 |
| 4.303981935417888 | 0.842 | 1.158 | 1.031 |
| 4.307123528071478 | 0.844 | 1.158 | 1.031 |
| 4.310265120725067 | 0.845 | 1.158 | 1.031 |
| 4.313406713378657 | 0.846 | 1.158 | 1.031 |
| 4.316548306032247 | 0.848 | 1.158 | 1.031 |
| 4.319689898685836 | 0.849 | 1.158 | 1.031 |
| 4.322831491339426 | 0.851 | 1.158 | 1.031 |
| 4.325973083993015 | 0.852 | 1.159 | 1.031 |
| 4.329114676646605 | 0.854 | 1.159 | 1.031 |
| 4.332256269300195 | 0.855 | 1.159 | 1.031 |
| 4.335397861953784 | 0.857 | 1.159 | 1.031 |
| 4.338539454607374 | 0.858 | 1.159 | 1.031 |
| 4.341681047260963 | 0.86 | 1.159 | 1.031 |
| 4.344822639914553 | 0.861 | 1.159 | 1.031 |
| 4.347964232568143 | 0.863 | 1.159 | 1.031 |
| 4.351105825221732 | 0.864 | 1.159 | 1.031 |
| 4.354247417875322 | 0.866 | 1.159 | 1.031 |
| 4.357389010528911 | 0.868 | 1.159 | 1.031 |
| 4.360530603182501 | 0.869 | 1.159 | 1.031 |
| 4.36367219583609 | 0.871 | 1.159 | 1.031 |
| 4.36681378848968 | 0.873 | 1.159 | 1.031 |
| 4.36995538114327 | 0.874 | 1.159 | 1.031 |
| 4.373096973796859 | 0.876 | 1.159 | 1.031 |
| 4.376238566450449 | 0.878 | 1.159 | 1.031 |
| 4.379380159104038 | 0.88 | 1.159 | 1.031 |
| 4.382521751757628 | 0.881 | 1.159 | 1.031 |
| 4.385663344411217 | 0.883 | 1.159 | 1.031 |
| 4.388804937064807 | 0.885 | 1.159 | 1.031 |
| 4.391946529718397 | 0.887 | 1.159 | 1.031 |
| 4.395088122371987 | 0.889 | 1.16 | 1.031 |
| 4.398229715025576 | 0.891 | 1.16 | 1.031 |
| 4.401371307679165 | 0.893 | 1.16 | 1.031 |
| 4.404512900332755 | 0.895 | 1.16 | 1.031 |
| 4.407654492986345 | 0.897 | 1.16 | 1.031 |
| 4.410796085639934 | 0.899 | 1.16 | 1.031 |
| 4.413937678293524 | 0.9 | 1.16 | 1.031 |
| 4.417079270947114 | 0.903 | 1.16 | 1.031 |
| 4.420220863600703 | 0.905 | 1.16 | 1.031 |
| 4.423362456254293 | 0.907 | 1.16 | 1.031 |
| 4.426504048907883 | 0.909 | 1.16 | 1.031 |
| 4.429645641561472 | 0.911 | 1.16 | 1.031 |
| 4.432787234215062 | 0.913 | 1.16 | 1.031 |
| 4.435928826868651 | 0.915 | 1.16 | 1.031 |
| 4.43907041952224 | 0.917 | 1.16 | 1.031 |
| 4.44221201217583 | 0.919 | 1.16 | 1.031 |
| 4.44535360482942 | 0.921 | 1.16 | 1.032 |
| 4.44849519748301 | 0.924 | 1.16 | 1.032 |
| 4.4516367901366 | 0.926 | 1.16 | 1.032 |
| 4.454778382790188 | 0.928 | 1.16 | 1.032 |
| 4.457919975443779 | 0.93 | 1.16 | 1.032 |
| 4.461061568097368 | 0.933 | 1.16 | 1.032 |
| 4.464203160750958 | 0.935 | 1.16 | 1.032 |
| 4.467344753404547 | 0.937 | 1.16 | 1.032 |
| 4.470486346058137 | 0.94 | 1.16 | 1.033 |
| 4.473627938711726 | 0.942 | 1.16 | 1.033 |
| 4.476769531365316 | 0.944 | 1.16 | 1.033 |
| 4.479911124018905 | 0.947 | 1.16 | 1.033 |
| 4.483052716672495 | 0.949 | 1.16 | 1.033 |
| 4.486194309326085 | 0.951 | 1.16 | 1.034 |
| 4.489335901979674 | 0.954 | 1.16 | 1.034 |
| 4.492477494633264 | 0.956 | 1.16 | 1.034 |
| 4.495619087286854 | 0.959 | 1.16 | 1.034 |
| 4.498760679940443 | 0.961 | 1.16 | 1.035 |
| 4.501902272594033 | 0.964 | 1.16 | 1.035 |
| 4.505043865247622 | 0.966 | 1.16 | 1.036 |
| 4.508185457901212 | 0.969 | 1.16 | 1.036 |
| 4.511327050554801 | 0.971 | 1.16 | 1.036 |
| 4.514468643208391 | 0.974 | 1.16 | 1.037 |
| 4.517610235861981 | 0.977 | 1.16 | 1.037 |
| 4.520751828515571 | 0.979 | 1.16 | 1.038 |
| 4.52389342116916 | 0.982 | 1.16 | 1.038 |
| 4.52703501382275 | 0.984 | 1.16 | 1.039 |
| 4.530176606476339 | 0.987 | 1.16 | 1.04 |
| 4.533318199129928 | 0.99 | 1.16 | 1.04 |
| 4.536459791783518 | 0.992 | 1.16 | 1.041 |
| 4.539601384437108 | 0.995 | 1.16 | 1.042 |
| 4.542742977090698 | 0.998 | 1.16 | 1.043 |
| 4.545884569744287 | 1.001 | 1.16 | 1.043 |
| 4.549026162397876 | 1.003 | 1.16 | 1.044 |
| 4.552167755051466 | 1.006 | 1.16 | 1.045 |
| 4.555309347705056 | 1.009 | 1.16 | 1.046 |
| 4.558450940358646 | 1.012 | 1.16 | 1.047 |
| 4.561592533012235 | 1.014 | 1.16 | 1.048 |
| 4.564734125665825 | 1.017 | 1.16 | 1.049 |
| 4.567875718319415 | 1.02 | 1.16 | 1.051 |
| 4.571017310973004 | 1.023 | 1.16 | 1.052 |
| 4.574158903626594 | 1.026 | 1.16 | 1.053 |
| 4.577300496280183 | 1.029 | 1.16 | 1.054 |
| 4.580442088933772 | 1.031 | 1.16 | 1.056 |
| 4.583583681587362 | 1.034 | 1.16 | 1.057 |
| 4.586725274240952 | 1.037 | 1.16 | 1.059 |
| 4.589866866894542 | 1.04 | 1.16 | 1.06 |
| 4.593008459548131 | 1.043 | 1.16 | 1.062 |
| 4.596150052201721 | 1.046 | 1.16 | 1.063 |
| 4.59929164485531 | 1.049 | 1.16 | 1.065 |
| 4.6024332375089 | 1.052 | 1.16 | 1.067 |
| 4.60557483016249 | 1.055 | 1.16 | 1.069 |
| 4.608716422816079 | 1.058 | 1.16 | 1.071 |
| 4.611858015469668 | 1.061 | 1.16 | 1.073 |
| 4.614999608123258 | 1.064 | 1.16 | 1.075 |
| 4.618141200776848 | 1.067 | 1.16 | 1.077 |
| 4.621282793430437 | 1.07 | 1.16 | 1.079 |
| 4.624424386084027 | 1.073 | 1.16 | 1.081 |
| 4.627565978737617 | 1.076 | 1.16 | 1.083 |
| 4.630707571391206 | 1.079 | 1.16 | 1.086 |
| 4.633849164044795 | 1.082 | 1.16 | 1.088 |
| 4.636990756698386 | 1.085 | 1.16 | 1.09 |
| 4.640132349351975 | 1.088 | 1.16 | 1.093 |
| 4.643273942005564 | 1.091 | 1.16 | 1.095 |
| 4.646415534659154 | 1.094 | 1.16 | 1.098 |
| 4.649557127312744 | 1.097 | 1.16 | 1.1 |
| 4.652698719966334 | 1.1 | 1.16 | 1.103 |
| 4.655840312619923 | 1.103 | 1.16 | 1.106 |
| 4.658981905273513 | 1.107 | 1.16 | 1.108 |
| 4.662123497927102 | 1.11 | 1.16 | 1.111 |
| 4.665265090580692 | 1.113 | 1.16 | 1.114 |
| 4.668406683234282 | 1.116 | 1.16 | 1.117 |
| 4.671548275887871 | 1.119 | 1.16 | 1.12 |
| 4.674689868541461 | 1.122 | 1.16 | 1.123 |
| 4.67783146119505 | 1.125 | 1.16 | 1.126 |
| 4.68097305384864 | 1.128 | 1.16 | 1.129 |
| 4.68411464650223 | 1.131 | 1.16 | 1.132 |
| 4.687256239155819 | 1.135 | 1.16 | 1.135 |
| 4.690397831809409 | 1.138 | 1.16 | 1.138 |
| 4.693539424462998 | 1.141 | 1.16 | 1.141 |
| 4.696681017116588 | 1.144 | 1.16 | 1.144 |
| 4.699822609770177 | 1.147 | 1.16 | 1.147 |
| 4.702964202423767 | 1.15 | 1.16 | 1.15 |
| 4.706105795077356 | 1.153 | 1.16 | 1.153 |
| 4.709247387730946 | 1.157 | 1.16 | 1.157 |
| 4.712388980384535 | 1.16 | 1.16 | 1.16 |
| 4.715530573038126 | 1.163 | 1.16 | 1.163 |
| 4.718672165691715 | 1.166 | 1.16 | 1.166 |
| 4.721813758345305 | 1.169 | 1.16 | 1.169 |
| 4.724955350998894 | 1.172 | 1.16 | 1.172 |
| 4.728096943652484 | 1.175 | 1.16 | 1.175 |
| 4.731238536306074 | 1.179 | 1.16 | 1.178 |
| 4.734380128959663 | 1.182 | 1.16 | 1.182 |
| 4.737521721613253 | 1.185 | 1.16 | 1.185 |
| 4.740663314266842 | 1.188 | 1.16 | 1.188 |
| 4.743804906920432 | 1.191 | 1.16 | 1.191 |
| 4.74694649957402 | 1.194 | 1.16 | 1.194 |
| 4.750088092227611 | 1.197 | 1.16 | 1.197 |
| 4.7532296848812 | 1.2 | 1.16 | 1.2 |
| 4.75637127753479 | 1.204 | 1.16 | 1.202 |
| 4.75951287018838 | 1.207 | 1.16 | 1.205 |
| 4.76265446284197 | 1.21 | 1.16 | 1.208 |
| 4.765796055495559 | 1.213 | 1.16 | 1.211 |
| 4.768937648149149 | 1.216 | 1.16 | 1.214 |
| 4.772079240802738 | 1.219 | 1.16 | 1.216 |
| 4.775220833456327 | 1.222 | 1.16 | 1.219 |
| 4.778362426109917 | 1.225 | 1.16 | 1.222 |
| 4.781504018763507 | 1.228 | 1.16 | 1.224 |
| 4.784645611417097 | 1.231 | 1.16 | 1.227 |
| 4.787787204070686 | 1.234 | 1.16 | 1.229 |
| 4.790928796724275 | 1.237 | 1.16 | 1.231 |
| 4.794070389377865 | 1.24 | 1.16 | 1.234 |
| 4.797211982031455 | 1.244 | 1.16 | 1.236 |
| 4.800353574685045 | 1.247 | 1.16 | 1.238 |
| 4.803495167338634 | 1.25 | 1.16 | 1.241 |
| 4.806636759992224 | 1.253 | 1.16 | 1.243 |
| 4.809778352645814 | 1.256 | 1.16 | 1.245 |
| 4.812919945299403 | 1.259 | 1.16 | 1.247 |
| 4.816061537952993 | 1.262 | 1.16 | 1.249 |
| 4.819203130606582 | 1.265 | 1.16 | 1.251 |
| 4.822344723260172 | 1.267 | 1.16 | 1.252 |
| 4.825486315913761 | 1.27 | 1.16 | 1.254 |
| 4.828627908567351 | 1.273 | 1.16 | 1.256 |
| 4.83176950122094 | 1.276 | 1.16 | 1.258 |
| 4.83491109387453 | 1.279 | 1.16 | 1.259 |
| 4.83805268652812 | 1.282 | 1.16 | 1.261 |
| 4.841194279181709 | 1.285 | 1.16 | 1.262 |
| 4.844335871835299 | 1.288 | 1.16 | 1.264 |
| 4.847477464488889 | 1.291 | 1.16 | 1.265 |
| 4.850619057142478 | 1.294 | 1.16 | 1.266 |
| 4.853760649796068 | 1.296 | 1.16 | 1.268 |
| 4.856902242449657 | 1.299 | 1.16 | 1.269 |
| 4.860043835103247 | 1.302 | 1.16 | 1.27 |
| 4.863185427756837 | 1.305 | 1.16 | 1.271 |
| 4.866327020410426 | 1.308 | 1.16 | 1.272 |
| 4.869468613064015 | 1.311 | 1.16 | 1.273 |
| 4.872610205717605 | 1.313 | 1.16 | 1.274 |
| 4.875751798371195 | 1.316 | 1.16 | 1.275 |
| 4.878893391024784 | 1.319 | 1.16 | 1.276 |
| 4.882034983678374 | 1.322 | 1.16 | 1.277 |
| 4.885176576331964 | 1.324 | 1.16 | 1.278 |
| 4.888318168985553 | 1.327 | 1.16 | 1.278 |
| 4.891459761639143 | 1.33 | 1.16 | 1.279 |
| 4.894601354292733 | 1.332 | 1.16 | 1.28 |
| 4.897742946946322 | 1.335 | 1.16 | 1.28 |
| 4.900884539599912 | 1.338 | 1.16 | 1.281 |
| 4.904026132253501 | 1.34 | 1.16 | 1.281 |
| 4.907167724907091 | 1.343 | 1.16 | 1.282 |
| 4.91030931756068 | 1.345 | 1.16 | 1.283 |
| 4.91345091021427 | 1.348 | 1.16 | 1.283 |
| 4.91659250286786 | 1.35 | 1.16 | 1.283 |
| 4.91973409552145 | 1.353 | 1.16 | 1.284 |
| 4.922875688175039 | 1.356 | 1.16 | 1.284 |
| 4.926017280828628 | 1.358 | 1.16 | 1.285 |
| 4.929158873482218 | 1.361 | 1.16 | 1.285 |
| 4.932300466135808 | 1.363 | 1.16 | 1.285 |
| 4.935442058789397 | 1.365 | 1.16 | 1.285 |
| 4.938583651442987 | 1.368 | 1.16 | 1.286 |
| 4.941725244096576 | 1.37 | 1.16 | 1.286 |
| 4.944866836750166 | 1.373 | 1.16 | 1.286 |
| 4.948008429403755 | 1.375 | 1.16 | 1.286 |
| 4.951150022057345 | 1.377 | 1.16 | 1.287 |
| 4.954291614710935 | 1.38 | 1.16 | 1.287 |
| 4.957433207364524 | 1.382 | 1.16 | 1.287 |
| 4.960574800018114 | 1.384 | 1.16 | 1.287 |
| 4.963716392671704 | 1.387 | 1.16 | 1.287 |
| 4.966857985325293 | 1.389 | 1.16 | 1.287 |
| 4.969999577978883 | 1.391 | 1.16 | 1.288 |
| 4.973141170632472 | 1.394 | 1.16 | 1.288 |
| 4.976282763286062 | 1.396 | 1.16 | 1.288 |
| 4.979424355939651 | 1.398 | 1.16 | 1.288 |
| 4.982565948593241 | 1.4 | 1.16 | 1.288 |
| 4.985707541246831 | 1.402 | 1.16 | 1.288 |
| 4.98884913390042 | 1.404 | 1.16 | 1.288 |
| 4.99199072655401 | 1.407 | 1.16 | 1.288 |
| 4.9951323192076 | 1.409 | 1.16 | 1.288 |
| 4.99827391186119 | 1.411 | 1.16 | 1.288 |
| 5.00141550451478 | 1.413 | 1.16 | 1.288 |
| 5.004557097168369 | 1.415 | 1.16 | 1.288 |
| 5.007698689821958 | 1.417 | 1.16 | 1.288 |
| 5.010840282475548 | 1.419 | 1.16 | 1.288 |
| 5.013981875129137 | 1.421 | 1.16 | 1.288 |
| 5.017123467782727 | 1.423 | 1.16 | 1.288 |
| 5.020265060436317 | 1.425 | 1.16 | 1.288 |
| 5.023406653089906 | 1.427 | 1.16 | 1.288 |
| 5.026548245743496 | 1.429 | 1.16 | 1.288 |
| 5.029689838397085 | 1.431 | 1.16 | 1.288 |
| 5.032831431050674 | 1.432 | 1.16 | 1.288 |
| 5.035973023704264 | 1.434 | 1.16 | 1.288 |
| 5.039114616357854 | 1.436 | 1.16 | 1.288 |
| 5.042256209011444 | 1.438 | 1.16 | 1.288 |
| 5.045397801665033 | 1.44 | 1.16 | 1.289 |
| 5.048539394318622 | 1.441 | 1.16 | 1.289 |
| 5.051680986972213 | 1.443 | 1.16 | 1.289 |
| 5.054822579625802 | 1.445 | 1.16 | 1.289 |
| 5.057964172279392 | 1.447 | 1.16 | 1.289 |
| 5.061105764932981 | 1.448 | 1.16 | 1.289 |
| 5.064247357586571 | 1.45 | 1.16 | 1.289 |
| 5.067388950240161 | 1.452 | 1.16 | 1.289 |
| 5.07053054289375 | 1.453 | 1.16 | 1.289 |
| 5.07367213554734 | 1.455 | 1.16 | 1.289 |
| 5.07681372820093 | 1.457 | 1.16 | 1.289 |
| 5.079955320854519 | 1.458 | 1.16 | 1.289 |
| 5.083096913508108 | 1.46 | 1.16 | 1.289 |
| 5.086238506161698 | 1.461 | 1.161 | 1.289 |
| 5.089380098815288 | 1.463 | 1.161 | 1.289 |
| 5.092521691468877 | 1.464 | 1.161 | 1.289 |
| 5.095663284122466 | 1.466 | 1.161 | 1.289 |
| 5.098804876776057 | 1.467 | 1.161 | 1.289 |
| 5.101946469429646 | 1.469 | 1.161 | 1.289 |
| 5.105088062083236 | 1.47 | 1.161 | 1.289 |
| 5.108229654736825 | 1.472 | 1.161 | 1.289 |
| 5.111371247390415 | 1.473 | 1.161 | 1.289 |
| 5.114512840044005 | 1.474 | 1.161 | 1.289 |
| 5.117654432697594 | 1.476 | 1.161 | 1.289 |
| 5.120796025351184 | 1.477 | 1.162 | 1.289 |
| 5.123937618004773 | 1.478 | 1.162 | 1.289 |
| 5.127079210658363 | 1.48 | 1.162 | 1.289 |
| 5.130220803311953 | 1.481 | 1.162 | 1.289 |
| 5.133362395965542 | 1.482 | 1.162 | 1.289 |
| 5.136503988619131 | 1.483 | 1.162 | 1.289 |
| 5.13964558127272 | 1.485 | 1.163 | 1.289 |
| 5.142787173926311 | 1.486 | 1.163 | 1.289 |
| 5.1459287665799 | 1.487 | 1.163 | 1.289 |
| 5.14907035923349 | 1.488 | 1.163 | 1.289 |
| 5.15221195188708 | 1.489 | 1.163 | 1.289 |
| 5.15535354454067 | 1.491 | 1.164 | 1.289 |
| 5.158495137194259 | 1.492 | 1.164 | 1.289 |
| 5.161636729847848 | 1.493 | 1.164 | 1.289 |
| 5.164778322501438 | 1.494 | 1.164 | 1.289 |
| 5.167919915155028 | 1.495 | 1.165 | 1.289 |
| 5.171061507808617 | 1.496 | 1.165 | 1.289 |
| 5.174203100462206 | 1.497 | 1.165 | 1.289 |
| 5.177344693115796 | 1.498 | 1.166 | 1.289 |
| 5.180486285769386 | 1.499 | 1.166 | 1.289 |
| 5.183627878422976 | 1.5 | 1.166 | 1.289 |
| 5.186769471076565 | 1.501 | 1.167 | 1.289 |
| 5.189911063730155 | 1.502 | 1.167 | 1.289 |
| 5.193052656383744 | 1.503 | 1.168 | 1.289 |
| 5.196194249037334 | 1.504 | 1.168 | 1.289 |
| 5.199335841690924 | 1.505 | 1.168 | 1.289 |
| 5.202477434344513 | 1.506 | 1.169 | 1.289 |
| 5.205619026998103 | 1.507 | 1.169 | 1.289 |
| 5.208760619651692 | 1.508 | 1.17 | 1.289 |
| 5.211902212305282 | 1.508 | 1.171 | 1.289 |
| 5.215043804958871 | 1.509 | 1.171 | 1.289 |
| 5.218185397612461 | 1.51 | 1.172 | 1.289 |
| 5.221326990266051 | 1.511 | 1.172 | 1.289 |
| 5.22446858291964 | 1.512 | 1.173 | 1.289 |
| 5.22761017557323 | 1.513 | 1.174 | 1.289 |
| 5.23075176822682 | 1.513 | 1.174 | 1.289 |
| 5.23389336088041 | 1.514 | 1.175 | 1.289 |
| 5.237034953533999 | 1.515 | 1.176 | 1.289 |
| 5.240176546187588 | 1.516 | 1.177 | 1.289 |
| 5.243318138841178 | 1.516 | 1.177 | 1.289 |
| 5.246459731494767 | 1.517 | 1.178 | 1.289 |
| 5.249601324148357 | 1.518 | 1.179 | 1.289 |
| 5.252742916801947 | 1.518 | 1.18 | 1.289 |
| 5.255884509455536 | 1.519 | 1.181 | 1.289 |
| 5.259026102109125 | 1.52 | 1.182 | 1.289 |
| 5.262167694762715 | 1.52 | 1.183 | 1.289 |
| 5.265309287416305 | 1.521 | 1.184 | 1.289 |
| 5.268450880069895 | 1.522 | 1.185 | 1.289 |
| 5.271592472723484 | 1.522 | 1.186 | 1.289 |
| 5.274734065377074 | 1.523 | 1.187 | 1.289 |
| 5.277875658030664 | 1.523 | 1.188 | 1.289 |
| 5.281017250684253 | 1.524 | 1.189 | 1.289 |
| 5.284158843337843 | 1.525 | 1.19 | 1.289 |
| 5.287300435991432 | 1.525 | 1.192 | 1.289 |
| 5.290442028645022 | 1.526 | 1.193 | 1.289 |
| 5.293583621298612 | 1.526 | 1.194 | 1.289 |
| 5.296725213952201 | 1.527 | 1.196 | 1.289 |
| 5.299866806605791 | 1.527 | 1.197 | 1.289 |
| 5.30300839925938 | 1.528 | 1.198 | 1.289 |
| 5.30614999191297 | 1.528 | 1.2 | 1.289 |
| 5.30929158456656 | 1.529 | 1.201 | 1.289 |
| 5.312433177220149 | 1.529 | 1.203 | 1.289 |
| 5.315574769873739 | 1.53 | 1.205 | 1.289 |
| 5.318716362527328 | 1.53 | 1.206 | 1.289 |
| 5.321857955180918 | 1.53 | 1.208 | 1.289 |
| 5.324999547834508 | 1.531 | 1.209 | 1.289 |
| 5.328141140488097 | 1.531 | 1.211 | 1.289 |
| 5.331282733141686 | 1.532 | 1.213 | 1.289 |
| 5.334424325795276 | 1.532 | 1.215 | 1.289 |
| 5.337565918448866 | 1.532 | 1.217 | 1.289 |
| 5.340707511102456 | 1.533 | 1.218 | 1.289 |
| 5.343849103756045 | 1.533 | 1.22 | 1.289 |
| 5.346990696409634 | 1.534 | 1.222 | 1.289 |
| 5.350132289063224 | 1.534 | 1.224 | 1.289 |
| 5.353273881716814 | 1.534 | 1.226 | 1.289 |
| 5.356415474370403 | 1.535 | 1.228 | 1.289 |
| 5.359557067023993 | 1.535 | 1.231 | 1.289 |
| 5.362698659677583 | 1.535 | 1.233 | 1.289 |
| 5.365840252331172 | 1.536 | 1.235 | 1.289 |
| 5.368981844984762 | 1.536 | 1.237 | 1.289 |
| 5.372123437638351 | 1.536 | 1.239 | 1.289 |
| 5.375265030291941 | 1.537 | 1.242 | 1.289 |
| 5.378406622945531 | 1.537 | 1.244 | 1.289 |
| 5.38154821559912 | 1.537 | 1.246 | 1.289 |
| 5.38468980825271 | 1.537 | 1.249 | 1.289 |
| 5.387831400906299 | 1.538 | 1.251 | 1.289 |
| 5.39097299355989 | 1.538 | 1.254 | 1.289 |
| 5.394114586213479 | 1.538 | 1.256 | 1.289 |
| 5.397256178867068 | 1.538 | 1.259 | 1.289 |
| 5.400397771520657 | 1.539 | 1.261 | 1.289 |
| 5.403539364174247 | 1.539 | 1.264 | 1.289 |
| 5.406680956827837 | 1.539 | 1.267 | 1.289 |
| 5.409822549481426 | 1.539 | 1.269 | 1.289 |
| 5.412964142135016 | 1.54 | 1.272 | 1.289 |
| 5.416105734788605 | 1.54 | 1.275 | 1.289 |
| 5.419247327442195 | 1.54 | 1.278 | 1.289 |
| 5.422388920095785 | 1.54 | 1.28 | 1.289 |
| 5.425530512749375 | 1.54 | 1.283 | 1.289 |
| 5.428672105402964 | 1.541 | 1.286 | 1.289 |
| 5.431813698056554 | 1.541 | 1.289 | 1.289 |
| 5.434955290710143 | 1.541 | 1.292 | 1.289 |
| 5.438096883363733 | 1.541 | 1.295 | 1.289 |
| 5.441238476017322 | 1.541 | 1.298 | 1.289 |
| 5.444380068670912 | 1.541 | 1.301 | 1.289 |
| 5.447521661324502 | 1.542 | 1.304 | 1.289 |
| 5.450663253978091 | 1.542 | 1.307 | 1.289 |
| 5.453804846631681 | 1.542 | 1.31 | 1.289 |
| 5.456946439285271 | 1.542 | 1.313 | 1.289 |
| 5.46008803193886 | 1.542 | 1.316 | 1.289 |
| 5.46322962459245 | 1.542 | 1.319 | 1.289 |
| 5.466371217246039 | 1.542 | 1.322 | 1.289 |
| 5.46951280989963 | 1.543 | 1.325 | 1.289 |
| 5.472654402553218 | 1.543 | 1.328 | 1.289 |
| 5.475795995206808 | 1.543 | 1.331 | 1.289 |
| 5.478937587860398 | 1.543 | 1.334 | 1.289 |
| 5.482079180513987 | 1.543 | 1.337 | 1.289 |
| 5.485220773167577 | 1.543 | 1.34 | 1.289 |
| 5.488362365821166 | 1.543 | 1.344 | 1.289 |
| 5.491503958474756 | 1.543 | 1.347 | 1.289 |
| 5.494645551128346 | 1.543 | 1.35 | 1.289 |
| 5.497787143781935 | 1.544 | 1.353 | 1.289 |
| 5.500928736435525 | 1.544 | 1.356 | 1.29 |
| 5.504070329089115 | 1.544 | 1.359 | 1.29 |
| 5.507211921742704 | 1.544 | 1.362 | 1.29 |
| 5.510353514396294 | 1.544 | 1.366 | 1.29 |
| 5.513495107049883 | 1.544 | 1.369 | 1.29 |
| 5.516636699703473 | 1.544 | 1.372 | 1.29 |
| 5.519778292357062 | 1.544 | 1.375 | 1.29 |
| 5.522919885010652 | 1.544 | 1.378 | 1.291 |
| 5.526061477664242 | 1.544 | 1.381 | 1.291 |
| 5.529203070317831 | 1.544 | 1.384 | 1.291 |
| 5.532344662971421 | 1.545 | 1.387 | 1.291 |
| 5.535486255625011 | 1.545 | 1.39 | 1.292 |
| 5.5386278482786 | 1.545 | 1.393 | 1.292 |
| 5.54176944093219 | 1.545 | 1.396 | 1.292 |
| 5.544911033585779 | 1.545 | 1.399 | 1.292 |
| 5.54805262623937 | 1.545 | 1.402 | 1.293 |
| 5.551194218892959 | 1.545 | 1.405 | 1.293 |
| 5.554335811546548 | 1.545 | 1.408 | 1.294 |
| 5.557477404200137 | 1.545 | 1.411 | 1.294 |
| 5.560618996853727 | 1.545 | 1.414 | 1.294 |
| 5.563760589507317 | 1.545 | 1.417 | 1.295 |
| 5.566902182160906 | 1.545 | 1.42 | 1.295 |
| 5.570043774814496 | 1.545 | 1.423 | 1.296 |
| 5.573185367468086 | 1.545 | 1.426 | 1.297 |
| 5.576326960121675 | 1.545 | 1.428 | 1.297 |
| 5.579468552775264 | 1.545 | 1.431 | 1.298 |
| 5.582610145428854 | 1.545 | 1.434 | 1.299 |
| 5.585751738082444 | 1.545 | 1.437 | 1.299 |
| 5.588893330736034 | 1.545 | 1.439 | 1.3 |
| 5.592034923389623 | 1.545 | 1.442 | 1.301 |
| 5.595176516043213 | 1.545 | 1.445 | 1.302 |
| 5.598318108696803 | 1.546 | 1.447 | 1.303 |
| 5.601459701350392 | 1.546 | 1.45 | 1.304 |
| 5.604601294003982 | 1.546 | 1.452 | 1.305 |
| 5.607742886657571 | 1.546 | 1.455 | 1.306 |
| 5.610884479311161 | 1.546 | 1.457 | 1.307 |
| 5.61402607196475 | 1.546 | 1.459 | 1.308 |
| 5.61716766461834 | 1.546 | 1.462 | 1.309 |
| 5.62030925727193 | 1.546 | 1.464 | 1.31 |
| 5.623450849925519 | 1.546 | 1.467 | 1.312 |
| 5.626592442579109 | 1.546 | 1.469 | 1.313 |
| 5.629734035232698 | 1.546 | 1.471 | 1.314 |
| 5.632875627886288 | 1.546 | 1.473 | 1.316 |
| 5.636017220539878 | 1.546 | 1.475 | 1.317 |
| 5.639158813193467 | 1.546 | 1.477 | 1.319 |
| 5.642300405847057 | 1.546 | 1.48 | 1.321 |
| 5.645441998500646 | 1.546 | 1.482 | 1.322 |
| 5.648583591154236 | 1.546 | 1.484 | 1.324 |
| 5.651725183807825 | 1.546 | 1.486 | 1.326 |
| 5.654866776461415 | 1.546 | 1.487 | 1.328 |
| 5.658008369115005 | 1.546 | 1.489 | 1.33 |
| 5.661149961768594 | 1.546 | 1.491 | 1.332 |
| 5.664291554422184 | 1.546 | 1.493 | 1.334 |
| 5.667433147075774 | 1.546 | 1.495 | 1.336 |
| 5.670574739729363 | 1.546 | 1.496 | 1.338 |
| 5.673716332382953 | 1.546 | 1.498 | 1.34 |
| 5.676857925036542 | 1.546 | 1.5 | 1.342 |
| 5.679999517690132 | 1.546 | 1.501 | 1.345 |
| 5.683141110343721 | 1.546 | 1.503 | 1.347 |
| 5.686282702997311 | 1.546 | 1.505 | 1.35 |
| 5.689424295650901 | 1.546 | 1.506 | 1.352 |
| 5.69256588830449 | 1.546 | 1.507 | 1.355 |
| 5.69570748095808 | 1.546 | 1.509 | 1.357 |
| 5.69884907361167 | 1.546 | 1.51 | 1.36 |
| 5.701990666265259 | 1.546 | 1.512 | 1.363 |
| 5.705132258918849 | 1.546 | 1.513 | 1.365 |
| 5.708273851572438 | 1.546 | 1.514 | 1.368 |
| 5.711415444226028 | 1.546 | 1.515 | 1.371 |
| 5.714557036879618 | 1.546 | 1.517 | 1.374 |
| 5.717698629533207 | 1.546 | 1.518 | 1.377 |
| 5.720840222186797 | 1.546 | 1.519 | 1.38 |
| 5.723981814840386 | 1.546 | 1.52 | 1.382 |
| 5.727123407493976 | 1.546 | 1.521 | 1.385 |
| 5.730265000147565 | 1.546 | 1.522 | 1.388 |
| 5.733406592801155 | 1.546 | 1.523 | 1.391 |
| 5.736548185454744 | 1.546 | 1.524 | 1.395 |
| 5.739689778108334 | 1.546 | 1.525 | 1.398 |
| 5.742831370761924 | 1.546 | 1.526 | 1.401 |
| 5.745972963415514 | 1.546 | 1.527 | 1.404 |
| 5.749114556069103 | 1.546 | 1.528 | 1.407 |
| 5.752256148722693 | 1.546 | 1.529 | 1.41 |
| 5.755397741376282 | 1.546 | 1.529 | 1.413 |
| 5.758539334029872 | 1.546 | 1.53 | 1.416 |
| 5.761680926683462 | 1.546 | 1.531 | 1.419 |
| 5.764822519337051 | 1.546 | 1.532 | 1.423 |
| 5.767964111990641 | 1.546 | 1.532 | 1.426 |
| 5.77110570464423 | 1.546 | 1.533 | 1.429 |
| 5.77424729729782 | 1.546 | 1.534 | 1.432 |
| 5.77738888995141 | 1.546 | 1.534 | 1.435 |
| 5.780530482605 | 1.546 | 1.535 | 1.438 |
| 5.783672075258588 | 1.546 | 1.535 | 1.441 |
| 5.786813667912178 | 1.546 | 1.536 | 1.444 |
| 5.789955260565768 | 1.546 | 1.536 | 1.447 |
| 5.793096853219358 | 1.546 | 1.537 | 1.45 |
| 5.796238445872947 | 1.546 | 1.537 | 1.453 |
| 5.799380038526537 | 1.546 | 1.538 | 1.456 |
| 5.802521631180126 | 1.546 | 1.538 | 1.459 |
| 5.805663223833715 | 1.546 | 1.539 | 1.462 |
| 5.808804816487306 | 1.546 | 1.539 | 1.465 |
| 5.811946409140895 | 1.546 | 1.54 | 1.468 |
| 5.815088001794485 | 1.546 | 1.54 | 1.47 |
| 5.818229594448074 | 1.546 | 1.54 | 1.473 |
| 5.821371187101663 | 1.546 | 1.541 | 1.476 |
| 5.824512779755254 | 1.546 | 1.541 | 1.478 |
| 5.827654372408843 | 1.546 | 1.541 | 1.481 |
| 5.830795965062433 | 1.546 | 1.542 | 1.484 |
| 5.833937557716022 | 1.546 | 1.542 | 1.486 |
| 5.837079150369612 | 1.546 | 1.542 | 1.488 |
| 5.840220743023201 | 1.546 | 1.542 | 1.491 |
| 5.843362335676791 | 1.546 | 1.543 | 1.493 |
| 5.846503928330381 | 1.546 | 1.543 | 1.495 |
| 5.84964552098397 | 1.546 | 1.543 | 1.498 |
| 5.85278711363756 | 1.546 | 1.543 | 1.5 |
| 5.85592870629115 | 1.546 | 1.543 | 1.502 |
| 5.85907029894474 | 1.546 | 1.544 | 1.504 |
| 5.862211891598329 | 1.546 | 1.544 | 1.506 |
| 5.865353484251918 | 1.546 | 1.544 | 1.508 |
| 5.868495076905508 | 1.546 | 1.544 | 1.51 |
| 5.871636669559098 | 1.546 | 1.544 | 1.511 |
| 5.874778262212687 | 1.546 | 1.544 | 1.513 |
| 5.877919854866277 | 1.546 | 1.544 | 1.515 |
| 5.881061447519866 | 1.546 | 1.545 | 1.516 |
| 5.884203040173456 | 1.546 | 1.545 | 1.518 |
| 5.887344632827046 | 1.546 | 1.545 | 1.519 |
| 5.890486225480635 | 1.546 | 1.545 | 1.521 |
| 5.893627818134224 | 1.546 | 1.545 | 1.522 |
| 5.896769410787814 | 1.546 | 1.545 | 1.524 |
| 5.899911003441404 | 1.546 | 1.545 | 1.525 |
| 5.903052596094994 | 1.546 | 1.545 | 1.526 |
| 5.906194188748583 | 1.546 | 1.545 | 1.527 |
| 5.909335781402172 | 1.546 | 1.545 | 1.528 |
| 5.912477374055762 | 1.546 | 1.545 | 1.53 |
| 5.915618966709352 | 1.546 | 1.546 | 1.531 |
| 5.918760559362942 | 1.546 | 1.546 | 1.532 |
| 5.921902152016531 | 1.546 | 1.546 | 1.532 |
| 5.92504374467012 | 1.546 | 1.546 | 1.533 |
| 5.92818533732371 | 1.546 | 1.546 | 1.534 |
| 5.9313269299773 | 1.546 | 1.546 | 1.535 |
| 5.93446852263089 | 1.546 | 1.546 | 1.536 |
| 5.93761011528448 | 1.546 | 1.546 | 1.537 |
| 5.940751707938068 | 1.546 | 1.546 | 1.537 |
| 5.943893300591658 | 1.546 | 1.546 | 1.538 |
| 5.947034893245248 | 1.546 | 1.546 | 1.538 |
| 5.950176485898837 | 1.546 | 1.546 | 1.539 |
| 5.953318078552427 | 1.546 | 1.546 | 1.54 |
| 5.956459671206017 | 1.546 | 1.546 | 1.54 |
| 5.959601263859606 | 1.546 | 1.546 | 1.541 |
| 5.962742856513196 | 1.546 | 1.546 | 1.541 |
| 5.965884449166785 | 1.546 | 1.546 | 1.541 |
| 5.969026041820375 | 1.546 | 1.546 | 1.542 |
| 5.972167634473964 | 1.546 | 1.546 | 1.542 |
| 5.975309227127554 | 1.546 | 1.546 | 1.542 |
| 5.978450819781144 | 1.546 | 1.546 | 1.543 |
| 5.981592412434733 | 1.546 | 1.546 | 1.543 |
| 5.984734005088323 | 1.546 | 1.546 | 1.543 |
| 5.987875597741913 | 1.546 | 1.546 | 1.544 |
| 5.991017190395502 | 1.546 | 1.546 | 1.544 |
| 5.994158783049092 | 1.546 | 1.546 | 1.544 |
| 5.997300375702681 | 1.546 | 1.546 | 1.544 |
| 6.000441968356271 | 1.546 | 1.546 | 1.544 |
| 6.003583561009861 | 1.546 | 1.546 | 1.545 |
| 6.00672515366345 | 1.546 | 1.546 | 1.545 |
| 6.00986674631704 | 1.546 | 1.546 | 1.545 |
| 6.01300833897063 | 1.546 | 1.546 | 1.545 |
| 6.01614993162422 | 1.546 | 1.546 | 1.545 |
| 6.019291524277808 | 1.546 | 1.546 | 1.545 |
| 6.022433116931398 | 1.546 | 1.546 | 1.545 |
| 6.025574709584988 | 1.546 | 1.546 | 1.545 |
| 6.028716302238577 | 1.546 | 1.546 | 1.546 |
| 6.031857894892167 | 1.546 | 1.546 | 1.546 |
| 6.034999487545757 | 1.546 | 1.546 | 1.546 |
| 6.038141080199346 | 1.546 | 1.546 | 1.546 |
| 6.041282672852935 | 1.546 | 1.546 | 1.546 |
| 6.044424265506525 | 1.546 | 1.546 | 1.546 |
| 6.047565858160115 | 1.546 | 1.546 | 1.546 |
| 6.050707450813704 | 1.546 | 1.546 | 1.546 |
| 6.053849043467294 | 1.546 | 1.546 | 1.546 |
| 6.056990636120884 | 1.546 | 1.546 | 1.546 |
| 6.060132228774473 | 1.546 | 1.546 | 1.546 |
| 6.063273821428063 | 1.546 | 1.546 | 1.546 |
| 6.066415414081653 | 1.546 | 1.546 | 1.546 |
| 6.069557006735242 | 1.546 | 1.546 | 1.546 |
| 6.072698599388831 | 1.546 | 1.546 | 1.546 |
| 6.07584019204242 | 1.546 | 1.546 | 1.546 |
| 6.078981784696011 | 1.546 | 1.546 | 1.546 |
| 6.082123377349601 | 1.546 | 1.546 | 1.546 |
| 6.08526497000319 | 1.546 | 1.546 | 1.546 |
| 6.08840656265678 | 1.546 | 1.546 | 1.546 |
| 6.09154815531037 | 1.546 | 1.546 | 1.546 |
| 6.094689747963959 | 1.546 | 1.546 | 1.546 |
| 6.097831340617549 | 1.546 | 1.546 | 1.546 |
| 6.100972933271138 | 1.546 | 1.546 | 1.546 |
| 6.104114525924728 | 1.546 | 1.546 | 1.546 |
| 6.107256118578317 | 1.546 | 1.546 | 1.546 |
| 6.110397711231907 | 1.546 | 1.546 | 1.546 |
| 6.113539303885497 | 1.546 | 1.546 | 1.546 |
| 6.116680896539086 | 1.546 | 1.546 | 1.546 |
| 6.119822489192675 | 1.546 | 1.546 | 1.546 |
| 6.122964081846265 | 1.546 | 1.546 | 1.546 |
| 6.126105674499855 | 1.546 | 1.546 | 1.546 |
| 6.129247267153445 | 1.546 | 1.546 | 1.546 |
| 6.132388859807034 | 1.546 | 1.546 | 1.546 |
| 6.135530452460624 | 1.546 | 1.546 | 1.546 |
| 6.138672045114213 | 1.546 | 1.546 | 1.546 |
| 6.141813637767803 | 1.546 | 1.546 | 1.546 |
| 6.144955230421393 | 1.546 | 1.546 | 1.546 |
| 6.148096823074982 | 1.546 | 1.546 | 1.546 |
| 6.151238415728571 | 1.546 | 1.546 | 1.546 |
| 6.154380008382161 | 1.546 | 1.546 | 1.546 |
| 6.157521601035751 | 1.546 | 1.546 | 1.546 |
| 6.16066319368934 | 1.546 | 1.546 | 1.546 |
| 6.16380478634293 | 1.546 | 1.546 | 1.546 |
| 6.16694637899652 | 1.546 | 1.546 | 1.546 |
| 6.170087971650109 | 1.546 | 1.546 | 1.546 |
| 6.173229564303698 | 1.546 | 1.546 | 1.546 |
| 6.176371156957289 | 1.546 | 1.546 | 1.546 |
| 6.179512749610878 | 1.546 | 1.546 | 1.546 |
| 6.182654342264468 | 1.546 | 1.546 | 1.546 |
| 6.185795934918057 | 1.546 | 1.546 | 1.546 |
| 6.188937527571647 | 1.546 | 1.546 | 1.546 |
| 6.192079120225237 | 1.546 | 1.546 | 1.546 |
| 6.195220712878826 | 1.546 | 1.546 | 1.546 |
| 6.198362305532415 | 1.546 | 1.546 | 1.546 |
| 6.201503898186005 | 1.546 | 1.546 | 1.546 |
| 6.204645490839594 | 1.546 | 1.546 | 1.546 |
| 6.207787083493184 | 1.546 | 1.546 | 1.546 |
| 6.210928676146774 | 1.546 | 1.546 | 1.546 |
| 6.214070268800364 | 1.546 | 1.546 | 1.546 |
| 6.217211861453953 | 1.546 | 1.546 | 1.546 |
| 6.220353454107543 | 1.546 | 1.546 | 1.546 |
| 6.223495046761133 | 1.546 | 1.546 | 1.546 |
| 6.226636639414722 | 1.546 | 1.546 | 1.546 |
| 6.229778232068312 | 1.546 | 1.546 | 1.546 |
| 6.232919824721901 | 1.546 | 1.546 | 1.546 |
| 6.236061417375491 | 1.546 | 1.546 | 1.546 |
| 6.23920301002908 | 1.546 | 1.546 | 1.546 |
| 6.24234460268267 | 1.546 | 1.546 | 1.546 |
| 6.24548619533626 | 1.546 | 1.546 | 1.546 |
| 6.24862778798985 | 1.546 | 1.546 | 1.546 |
| 6.251769380643438 | 1.546 | 1.546 | 1.546 |
| 6.254910973297028 | 1.546 | 1.546 | 1.546 |
| 6.258052565950618 | 1.546 | 1.546 | 1.546 |
| 6.261194158604208 | 1.546 | 1.546 | 1.546 |
| 6.264335751257797 | 1.546 | 1.546 | 1.546 |
| 6.267477343911387 | 1.546 | 1.546 | 1.546 |
| 6.270618936564976 | 1.546 | 1.546 | 1.546 |
| 6.273760529218566 | 1.546 | 1.546 | 1.546 |
| 6.276902121872155 | 1.546 | 1.546 | 1.546 |
| 6.280043714525745 | 1.546 | 1.546 | 1.546 |
| 6.283185307179335 | 1.546 | 1.546 | 1.546 |